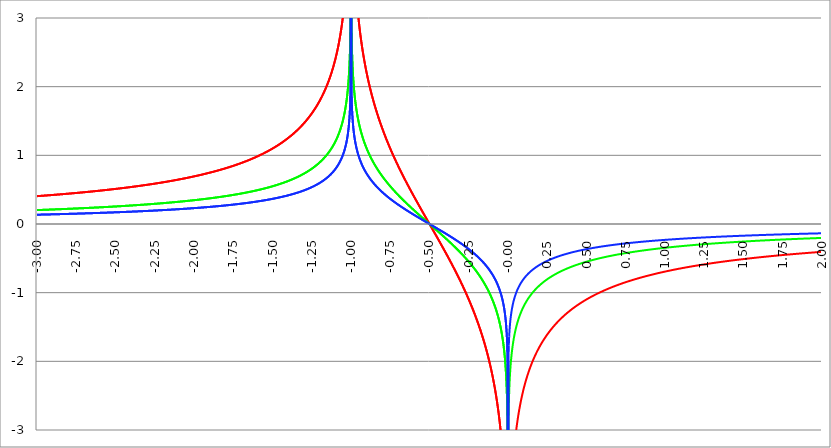
| Category | Series 1 | Series 0 | Series 2 |
|---|---|---|---|
| -3.0 | 0.405 | 0.203 | 0.135 |
| -2.9975 | 0.406 | 0.203 | 0.135 |
| -2.995 | 0.406 | 0.203 | 0.135 |
| -2.9925 | 0.407 | 0.203 | 0.136 |
| -2.99 | 0.407 | 0.204 | 0.136 |
| -2.9875 | 0.408 | 0.204 | 0.136 |
| -2.985 | 0.408 | 0.204 | 0.136 |
| -2.9825 | 0.408 | 0.204 | 0.136 |
| -2.98 | 0.409 | 0.204 | 0.136 |
| -2.9775 | 0.409 | 0.205 | 0.136 |
| -2.975000000000001 | 0.41 | 0.205 | 0.137 |
| -2.972500000000001 | 0.41 | 0.205 | 0.137 |
| -2.970000000000001 | 0.411 | 0.205 | 0.137 |
| -2.967500000000001 | 0.411 | 0.205 | 0.137 |
| -2.965000000000001 | 0.411 | 0.206 | 0.137 |
| -2.962500000000001 | 0.412 | 0.206 | 0.137 |
| -2.960000000000001 | 0.412 | 0.206 | 0.137 |
| -2.957500000000001 | 0.413 | 0.206 | 0.138 |
| -2.955000000000001 | 0.413 | 0.207 | 0.138 |
| -2.952500000000001 | 0.414 | 0.207 | 0.138 |
| -2.950000000000001 | 0.414 | 0.207 | 0.138 |
| -2.947500000000001 | 0.414 | 0.207 | 0.138 |
| -2.945000000000001 | 0.415 | 0.207 | 0.138 |
| -2.942500000000001 | 0.415 | 0.208 | 0.138 |
| -2.940000000000001 | 0.416 | 0.208 | 0.139 |
| -2.937500000000001 | 0.416 | 0.208 | 0.139 |
| -2.935000000000001 | 0.417 | 0.208 | 0.139 |
| -2.932500000000001 | 0.417 | 0.209 | 0.139 |
| -2.930000000000001 | 0.417 | 0.209 | 0.139 |
| -2.927500000000002 | 0.418 | 0.209 | 0.139 |
| -2.925000000000002 | 0.418 | 0.209 | 0.139 |
| -2.922500000000002 | 0.419 | 0.209 | 0.14 |
| -2.920000000000002 | 0.419 | 0.21 | 0.14 |
| -2.917500000000002 | 0.42 | 0.21 | 0.14 |
| -2.915000000000002 | 0.42 | 0.21 | 0.14 |
| -2.912500000000002 | 0.421 | 0.21 | 0.14 |
| -2.910000000000002 | 0.421 | 0.211 | 0.14 |
| -2.907500000000002 | 0.422 | 0.211 | 0.141 |
| -2.905000000000002 | 0.422 | 0.211 | 0.141 |
| -2.902500000000002 | 0.422 | 0.211 | 0.141 |
| -2.900000000000002 | 0.423 | 0.211 | 0.141 |
| -2.897500000000002 | 0.423 | 0.212 | 0.141 |
| -2.895000000000002 | 0.424 | 0.212 | 0.141 |
| -2.892500000000002 | 0.424 | 0.212 | 0.141 |
| -2.890000000000002 | 0.425 | 0.212 | 0.142 |
| -2.887500000000002 | 0.425 | 0.213 | 0.142 |
| -2.885000000000002 | 0.426 | 0.213 | 0.142 |
| -2.882500000000002 | 0.426 | 0.213 | 0.142 |
| -2.880000000000002 | 0.427 | 0.213 | 0.142 |
| -2.877500000000003 | 0.427 | 0.213 | 0.142 |
| -2.875000000000003 | 0.427 | 0.214 | 0.142 |
| -2.872500000000003 | 0.428 | 0.214 | 0.143 |
| -2.870000000000003 | 0.428 | 0.214 | 0.143 |
| -2.867500000000003 | 0.429 | 0.214 | 0.143 |
| -2.865000000000003 | 0.429 | 0.215 | 0.143 |
| -2.862500000000003 | 0.43 | 0.215 | 0.143 |
| -2.860000000000003 | 0.43 | 0.215 | 0.143 |
| -2.857500000000003 | 0.431 | 0.215 | 0.144 |
| -2.855000000000003 | 0.431 | 0.216 | 0.144 |
| -2.852500000000003 | 0.432 | 0.216 | 0.144 |
| -2.850000000000003 | 0.432 | 0.216 | 0.144 |
| -2.847500000000003 | 0.433 | 0.216 | 0.144 |
| -2.845000000000003 | 0.433 | 0.217 | 0.144 |
| -2.842500000000003 | 0.434 | 0.217 | 0.145 |
| -2.840000000000003 | 0.434 | 0.217 | 0.145 |
| -2.837500000000003 | 0.435 | 0.217 | 0.145 |
| -2.835000000000003 | 0.435 | 0.217 | 0.145 |
| -2.832500000000004 | 0.435 | 0.218 | 0.145 |
| -2.830000000000004 | 0.436 | 0.218 | 0.145 |
| -2.827500000000004 | 0.436 | 0.218 | 0.145 |
| -2.825000000000004 | 0.437 | 0.218 | 0.146 |
| -2.822500000000004 | 0.437 | 0.219 | 0.146 |
| -2.820000000000004 | 0.438 | 0.219 | 0.146 |
| -2.817500000000004 | 0.438 | 0.219 | 0.146 |
| -2.815000000000004 | 0.439 | 0.219 | 0.146 |
| -2.812500000000004 | 0.439 | 0.22 | 0.146 |
| -2.810000000000004 | 0.44 | 0.22 | 0.147 |
| -2.807500000000004 | 0.44 | 0.22 | 0.147 |
| -2.805000000000004 | 0.441 | 0.22 | 0.147 |
| -2.802500000000004 | 0.441 | 0.221 | 0.147 |
| -2.800000000000004 | 0.442 | 0.221 | 0.147 |
| -2.797500000000004 | 0.442 | 0.221 | 0.147 |
| -2.795000000000004 | 0.443 | 0.221 | 0.148 |
| -2.792500000000004 | 0.443 | 0.222 | 0.148 |
| -2.790000000000004 | 0.444 | 0.222 | 0.148 |
| -2.787500000000004 | 0.444 | 0.222 | 0.148 |
| -2.785000000000004 | 0.445 | 0.222 | 0.148 |
| -2.782500000000005 | 0.445 | 0.223 | 0.148 |
| -2.780000000000005 | 0.446 | 0.223 | 0.149 |
| -2.777500000000005 | 0.446 | 0.223 | 0.149 |
| -2.775000000000005 | 0.447 | 0.223 | 0.149 |
| -2.772500000000005 | 0.447 | 0.224 | 0.149 |
| -2.770000000000005 | 0.448 | 0.224 | 0.149 |
| -2.767500000000005 | 0.448 | 0.224 | 0.149 |
| -2.765000000000005 | 0.449 | 0.224 | 0.15 |
| -2.762500000000005 | 0.449 | 0.225 | 0.15 |
| -2.760000000000005 | 0.45 | 0.225 | 0.15 |
| -2.757500000000005 | 0.45 | 0.225 | 0.15 |
| -2.755000000000005 | 0.451 | 0.225 | 0.15 |
| -2.752500000000005 | 0.451 | 0.226 | 0.15 |
| -2.750000000000005 | 0.452 | 0.226 | 0.151 |
| -2.747500000000005 | 0.453 | 0.226 | 0.151 |
| -2.745000000000005 | 0.453 | 0.227 | 0.151 |
| -2.742500000000005 | 0.454 | 0.227 | 0.151 |
| -2.740000000000005 | 0.454 | 0.227 | 0.151 |
| -2.737500000000006 | 0.455 | 0.227 | 0.152 |
| -2.735000000000006 | 0.455 | 0.228 | 0.152 |
| -2.732500000000006 | 0.456 | 0.228 | 0.152 |
| -2.730000000000006 | 0.456 | 0.228 | 0.152 |
| -2.727500000000006 | 0.457 | 0.228 | 0.152 |
| -2.725000000000006 | 0.457 | 0.229 | 0.152 |
| -2.722500000000006 | 0.458 | 0.229 | 0.153 |
| -2.720000000000006 | 0.458 | 0.229 | 0.153 |
| -2.717500000000006 | 0.459 | 0.229 | 0.153 |
| -2.715000000000006 | 0.459 | 0.23 | 0.153 |
| -2.712500000000006 | 0.46 | 0.23 | 0.153 |
| -2.710000000000006 | 0.46 | 0.23 | 0.153 |
| -2.707500000000006 | 0.461 | 0.23 | 0.154 |
| -2.705000000000006 | 0.462 | 0.231 | 0.154 |
| -2.702500000000006 | 0.462 | 0.231 | 0.154 |
| -2.700000000000006 | 0.463 | 0.231 | 0.154 |
| -2.697500000000006 | 0.463 | 0.232 | 0.154 |
| -2.695000000000006 | 0.464 | 0.232 | 0.155 |
| -2.692500000000006 | 0.464 | 0.232 | 0.155 |
| -2.690000000000006 | 0.465 | 0.232 | 0.155 |
| -2.687500000000006 | 0.465 | 0.233 | 0.155 |
| -2.685000000000007 | 0.466 | 0.233 | 0.155 |
| -2.682500000000007 | 0.466 | 0.233 | 0.155 |
| -2.680000000000007 | 0.467 | 0.234 | 0.156 |
| -2.677500000000007 | 0.468 | 0.234 | 0.156 |
| -2.675000000000007 | 0.468 | 0.234 | 0.156 |
| -2.672500000000007 | 0.469 | 0.234 | 0.156 |
| -2.670000000000007 | 0.469 | 0.235 | 0.156 |
| -2.667500000000007 | 0.47 | 0.235 | 0.157 |
| -2.665000000000007 | 0.47 | 0.235 | 0.157 |
| -2.662500000000007 | 0.471 | 0.235 | 0.157 |
| -2.660000000000007 | 0.472 | 0.236 | 0.157 |
| -2.657500000000007 | 0.472 | 0.236 | 0.157 |
| -2.655000000000007 | 0.473 | 0.236 | 0.158 |
| -2.652500000000007 | 0.473 | 0.237 | 0.158 |
| -2.650000000000007 | 0.474 | 0.237 | 0.158 |
| -2.647500000000007 | 0.474 | 0.237 | 0.158 |
| -2.645000000000007 | 0.475 | 0.237 | 0.158 |
| -2.642500000000008 | 0.476 | 0.238 | 0.159 |
| -2.640000000000008 | 0.476 | 0.238 | 0.159 |
| -2.637500000000008 | 0.477 | 0.238 | 0.159 |
| -2.635000000000008 | 0.477 | 0.239 | 0.159 |
| -2.632500000000008 | 0.478 | 0.239 | 0.159 |
| -2.630000000000008 | 0.478 | 0.239 | 0.159 |
| -2.627500000000008 | 0.479 | 0.239 | 0.16 |
| -2.625000000000008 | 0.48 | 0.24 | 0.16 |
| -2.622500000000008 | 0.48 | 0.24 | 0.16 |
| -2.620000000000008 | 0.481 | 0.24 | 0.16 |
| -2.617500000000008 | 0.481 | 0.241 | 0.16 |
| -2.615000000000008 | 0.482 | 0.241 | 0.161 |
| -2.612500000000008 | 0.483 | 0.241 | 0.161 |
| -2.610000000000008 | 0.483 | 0.242 | 0.161 |
| -2.607500000000008 | 0.484 | 0.242 | 0.161 |
| -2.605000000000008 | 0.484 | 0.242 | 0.161 |
| -2.602500000000008 | 0.485 | 0.242 | 0.162 |
| -2.600000000000008 | 0.486 | 0.243 | 0.162 |
| -2.597500000000009 | 0.486 | 0.243 | 0.162 |
| -2.595000000000009 | 0.487 | 0.243 | 0.162 |
| -2.592500000000009 | 0.487 | 0.244 | 0.162 |
| -2.590000000000009 | 0.488 | 0.244 | 0.163 |
| -2.587500000000009 | 0.489 | 0.244 | 0.163 |
| -2.585000000000009 | 0.489 | 0.245 | 0.163 |
| -2.582500000000009 | 0.49 | 0.245 | 0.163 |
| -2.580000000000009 | 0.49 | 0.245 | 0.163 |
| -2.577500000000009 | 0.491 | 0.245 | 0.164 |
| -2.575000000000009 | 0.492 | 0.246 | 0.164 |
| -2.572500000000009 | 0.492 | 0.246 | 0.164 |
| -2.570000000000009 | 0.493 | 0.246 | 0.164 |
| -2.56750000000001 | 0.493 | 0.247 | 0.164 |
| -2.565000000000009 | 0.494 | 0.247 | 0.165 |
| -2.562500000000009 | 0.495 | 0.247 | 0.165 |
| -2.560000000000009 | 0.495 | 0.248 | 0.165 |
| -2.557500000000009 | 0.496 | 0.248 | 0.165 |
| -2.555000000000009 | 0.497 | 0.248 | 0.166 |
| -2.55250000000001 | 0.497 | 0.249 | 0.166 |
| -2.55000000000001 | 0.498 | 0.249 | 0.166 |
| -2.54750000000001 | 0.498 | 0.249 | 0.166 |
| -2.54500000000001 | 0.499 | 0.25 | 0.166 |
| -2.54250000000001 | 0.5 | 0.25 | 0.167 |
| -2.54000000000001 | 0.5 | 0.25 | 0.167 |
| -2.53750000000001 | 0.501 | 0.251 | 0.167 |
| -2.53500000000001 | 0.502 | 0.251 | 0.167 |
| -2.53250000000001 | 0.502 | 0.251 | 0.167 |
| -2.53000000000001 | 0.503 | 0.251 | 0.168 |
| -2.52750000000001 | 0.504 | 0.252 | 0.168 |
| -2.52500000000001 | 0.504 | 0.252 | 0.168 |
| -2.52250000000001 | 0.505 | 0.252 | 0.168 |
| -2.52000000000001 | 0.506 | 0.253 | 0.169 |
| -2.51750000000001 | 0.506 | 0.253 | 0.169 |
| -2.51500000000001 | 0.507 | 0.253 | 0.169 |
| -2.51250000000001 | 0.508 | 0.254 | 0.169 |
| -2.51000000000001 | 0.508 | 0.254 | 0.169 |
| -2.50750000000001 | 0.509 | 0.254 | 0.17 |
| -2.505000000000011 | 0.509 | 0.255 | 0.17 |
| -2.502500000000011 | 0.51 | 0.255 | 0.17 |
| -2.500000000000011 | 0.511 | 0.255 | 0.17 |
| -2.497500000000011 | 0.511 | 0.256 | 0.17 |
| -2.495000000000011 | 0.512 | 0.256 | 0.171 |
| -2.492500000000011 | 0.513 | 0.256 | 0.171 |
| -2.490000000000011 | 0.514 | 0.257 | 0.171 |
| -2.487500000000011 | 0.514 | 0.257 | 0.171 |
| -2.485000000000011 | 0.515 | 0.257 | 0.172 |
| -2.482500000000011 | 0.516 | 0.258 | 0.172 |
| -2.480000000000011 | 0.516 | 0.258 | 0.172 |
| -2.477500000000011 | 0.517 | 0.258 | 0.172 |
| -2.475000000000011 | 0.518 | 0.259 | 0.173 |
| -2.472500000000011 | 0.518 | 0.259 | 0.173 |
| -2.470000000000011 | 0.519 | 0.259 | 0.173 |
| -2.467500000000011 | 0.52 | 0.26 | 0.173 |
| -2.465000000000011 | 0.52 | 0.26 | 0.173 |
| -2.462500000000011 | 0.521 | 0.261 | 0.174 |
| -2.460000000000011 | 0.522 | 0.261 | 0.174 |
| -2.457500000000012 | 0.522 | 0.261 | 0.174 |
| -2.455000000000012 | 0.523 | 0.262 | 0.174 |
| -2.452500000000012 | 0.524 | 0.262 | 0.175 |
| -2.450000000000012 | 0.525 | 0.262 | 0.175 |
| -2.447500000000012 | 0.525 | 0.263 | 0.175 |
| -2.445000000000012 | 0.526 | 0.263 | 0.175 |
| -2.442500000000012 | 0.527 | 0.263 | 0.176 |
| -2.440000000000012 | 0.527 | 0.264 | 0.176 |
| -2.437500000000012 | 0.528 | 0.264 | 0.176 |
| -2.435000000000012 | 0.529 | 0.264 | 0.176 |
| -2.432500000000012 | 0.529 | 0.265 | 0.176 |
| -2.430000000000012 | 0.53 | 0.265 | 0.177 |
| -2.427500000000012 | 0.531 | 0.265 | 0.177 |
| -2.425000000000012 | 0.532 | 0.266 | 0.177 |
| -2.422500000000012 | 0.532 | 0.266 | 0.177 |
| -2.420000000000012 | 0.533 | 0.267 | 0.178 |
| -2.417500000000012 | 0.534 | 0.267 | 0.178 |
| -2.415000000000012 | 0.535 | 0.267 | 0.178 |
| -2.412500000000012 | 0.535 | 0.268 | 0.178 |
| -2.410000000000013 | 0.536 | 0.268 | 0.179 |
| -2.407500000000012 | 0.537 | 0.268 | 0.179 |
| -2.405000000000013 | 0.538 | 0.269 | 0.179 |
| -2.402500000000013 | 0.538 | 0.269 | 0.179 |
| -2.400000000000013 | 0.539 | 0.269 | 0.18 |
| -2.397500000000013 | 0.54 | 0.27 | 0.18 |
| -2.395000000000013 | 0.54 | 0.27 | 0.18 |
| -2.392500000000013 | 0.541 | 0.271 | 0.18 |
| -2.390000000000013 | 0.542 | 0.271 | 0.181 |
| -2.387500000000013 | 0.543 | 0.271 | 0.181 |
| -2.385000000000013 | 0.543 | 0.272 | 0.181 |
| -2.382500000000013 | 0.544 | 0.272 | 0.181 |
| -2.380000000000013 | 0.545 | 0.273 | 0.182 |
| -2.377500000000013 | 0.546 | 0.273 | 0.182 |
| -2.375000000000013 | 0.547 | 0.273 | 0.182 |
| -2.372500000000013 | 0.547 | 0.274 | 0.182 |
| -2.370000000000013 | 0.548 | 0.274 | 0.183 |
| -2.367500000000013 | 0.549 | 0.274 | 0.183 |
| -2.365000000000013 | 0.55 | 0.275 | 0.183 |
| -2.362500000000014 | 0.55 | 0.275 | 0.183 |
| -2.360000000000014 | 0.551 | 0.276 | 0.184 |
| -2.357500000000014 | 0.552 | 0.276 | 0.184 |
| -2.355000000000014 | 0.553 | 0.276 | 0.184 |
| -2.352500000000014 | 0.554 | 0.277 | 0.185 |
| -2.350000000000014 | 0.554 | 0.277 | 0.185 |
| -2.347500000000014 | 0.555 | 0.278 | 0.185 |
| -2.345000000000014 | 0.556 | 0.278 | 0.185 |
| -2.342500000000014 | 0.557 | 0.278 | 0.186 |
| -2.340000000000014 | 0.557 | 0.279 | 0.186 |
| -2.337500000000014 | 0.558 | 0.279 | 0.186 |
| -2.335000000000014 | 0.559 | 0.28 | 0.186 |
| -2.332500000000014 | 0.56 | 0.28 | 0.187 |
| -2.330000000000014 | 0.561 | 0.28 | 0.187 |
| -2.327500000000014 | 0.561 | 0.281 | 0.187 |
| -2.325000000000014 | 0.562 | 0.281 | 0.187 |
| -2.322500000000014 | 0.563 | 0.282 | 0.188 |
| -2.320000000000014 | 0.564 | 0.282 | 0.188 |
| -2.317500000000015 | 0.565 | 0.282 | 0.188 |
| -2.315000000000015 | 0.566 | 0.283 | 0.189 |
| -2.312500000000015 | 0.566 | 0.283 | 0.189 |
| -2.310000000000015 | 0.567 | 0.284 | 0.189 |
| -2.307500000000015 | 0.568 | 0.284 | 0.189 |
| -2.305000000000015 | 0.569 | 0.284 | 0.19 |
| -2.302500000000015 | 0.57 | 0.285 | 0.19 |
| -2.300000000000015 | 0.571 | 0.285 | 0.19 |
| -2.297500000000015 | 0.571 | 0.286 | 0.19 |
| -2.295000000000015 | 0.572 | 0.286 | 0.191 |
| -2.292500000000015 | 0.573 | 0.287 | 0.191 |
| -2.290000000000015 | 0.574 | 0.287 | 0.191 |
| -2.287500000000015 | 0.575 | 0.287 | 0.192 |
| -2.285000000000015 | 0.576 | 0.288 | 0.192 |
| -2.282500000000015 | 0.576 | 0.288 | 0.192 |
| -2.280000000000015 | 0.577 | 0.289 | 0.192 |
| -2.277500000000015 | 0.578 | 0.289 | 0.193 |
| -2.275000000000015 | 0.579 | 0.29 | 0.193 |
| -2.272500000000015 | 0.58 | 0.29 | 0.193 |
| -2.270000000000016 | 0.581 | 0.29 | 0.194 |
| -2.267500000000015 | 0.582 | 0.291 | 0.194 |
| -2.265000000000016 | 0.583 | 0.291 | 0.194 |
| -2.262500000000016 | 0.583 | 0.292 | 0.194 |
| -2.260000000000016 | 0.584 | 0.292 | 0.195 |
| -2.257500000000016 | 0.585 | 0.293 | 0.195 |
| -2.255000000000016 | 0.586 | 0.293 | 0.195 |
| -2.252500000000016 | 0.587 | 0.293 | 0.196 |
| -2.250000000000016 | 0.588 | 0.294 | 0.196 |
| -2.247500000000016 | 0.589 | 0.294 | 0.196 |
| -2.245000000000016 | 0.59 | 0.295 | 0.197 |
| -2.242500000000016 | 0.59 | 0.295 | 0.197 |
| -2.240000000000016 | 0.591 | 0.296 | 0.197 |
| -2.237500000000016 | 0.592 | 0.296 | 0.197 |
| -2.235000000000016 | 0.593 | 0.297 | 0.198 |
| -2.232500000000016 | 0.594 | 0.297 | 0.198 |
| -2.230000000000016 | 0.595 | 0.297 | 0.198 |
| -2.227500000000016 | 0.596 | 0.298 | 0.199 |
| -2.225000000000016 | 0.597 | 0.298 | 0.199 |
| -2.222500000000016 | 0.598 | 0.299 | 0.199 |
| -2.220000000000016 | 0.599 | 0.299 | 0.2 |
| -2.217500000000016 | 0.6 | 0.3 | 0.2 |
| -2.215000000000017 | 0.601 | 0.3 | 0.2 |
| -2.212500000000017 | 0.601 | 0.301 | 0.2 |
| -2.210000000000017 | 0.602 | 0.301 | 0.201 |
| -2.207500000000016 | 0.603 | 0.302 | 0.201 |
| -2.205000000000017 | 0.604 | 0.302 | 0.201 |
| -2.202500000000017 | 0.605 | 0.303 | 0.202 |
| -2.200000000000017 | 0.606 | 0.303 | 0.202 |
| -2.197500000000017 | 0.607 | 0.304 | 0.202 |
| -2.195000000000017 | 0.608 | 0.304 | 0.203 |
| -2.192500000000017 | 0.609 | 0.304 | 0.203 |
| -2.190000000000017 | 0.61 | 0.305 | 0.203 |
| -2.187500000000017 | 0.611 | 0.305 | 0.204 |
| -2.185000000000017 | 0.612 | 0.306 | 0.204 |
| -2.182500000000017 | 0.613 | 0.306 | 0.204 |
| -2.180000000000017 | 0.614 | 0.307 | 0.205 |
| -2.177500000000017 | 0.615 | 0.307 | 0.205 |
| -2.175000000000018 | 0.616 | 0.308 | 0.205 |
| -2.172500000000018 | 0.617 | 0.308 | 0.206 |
| -2.170000000000018 | 0.618 | 0.309 | 0.206 |
| -2.167500000000017 | 0.619 | 0.309 | 0.206 |
| -2.165000000000018 | 0.62 | 0.31 | 0.207 |
| -2.162500000000018 | 0.621 | 0.31 | 0.207 |
| -2.160000000000018 | 0.622 | 0.311 | 0.207 |
| -2.157500000000018 | 0.623 | 0.311 | 0.208 |
| -2.155000000000018 | 0.624 | 0.312 | 0.208 |
| -2.152500000000018 | 0.625 | 0.312 | 0.208 |
| -2.150000000000018 | 0.626 | 0.313 | 0.209 |
| -2.147500000000018 | 0.627 | 0.313 | 0.209 |
| -2.145000000000018 | 0.628 | 0.314 | 0.209 |
| -2.142500000000018 | 0.629 | 0.314 | 0.21 |
| -2.140000000000018 | 0.63 | 0.315 | 0.21 |
| -2.137500000000018 | 0.631 | 0.315 | 0.21 |
| -2.135000000000018 | 0.632 | 0.316 | 0.211 |
| -2.132500000000018 | 0.633 | 0.316 | 0.211 |
| -2.130000000000019 | 0.634 | 0.317 | 0.211 |
| -2.127500000000018 | 0.635 | 0.317 | 0.212 |
| -2.125000000000019 | 0.636 | 0.318 | 0.212 |
| -2.122500000000019 | 0.637 | 0.319 | 0.212 |
| -2.120000000000019 | 0.638 | 0.319 | 0.213 |
| -2.117500000000019 | 0.639 | 0.32 | 0.213 |
| -2.115000000000019 | 0.64 | 0.32 | 0.213 |
| -2.112500000000019 | 0.641 | 0.321 | 0.214 |
| -2.110000000000019 | 0.642 | 0.321 | 0.214 |
| -2.10750000000002 | 0.643 | 0.322 | 0.214 |
| -2.10500000000002 | 0.644 | 0.322 | 0.215 |
| -2.10250000000002 | 0.646 | 0.323 | 0.215 |
| -2.10000000000002 | 0.647 | 0.323 | 0.216 |
| -2.09750000000002 | 0.648 | 0.324 | 0.216 |
| -2.095000000000019 | 0.649 | 0.324 | 0.216 |
| -2.092500000000019 | 0.65 | 0.325 | 0.217 |
| -2.090000000000019 | 0.651 | 0.325 | 0.217 |
| -2.08750000000002 | 0.652 | 0.326 | 0.217 |
| -2.085000000000019 | 0.653 | 0.327 | 0.218 |
| -2.08250000000002 | 0.654 | 0.327 | 0.218 |
| -2.08000000000002 | 0.655 | 0.328 | 0.218 |
| -2.07750000000002 | 0.657 | 0.328 | 0.219 |
| -2.07500000000002 | 0.658 | 0.329 | 0.219 |
| -2.07250000000002 | 0.659 | 0.329 | 0.22 |
| -2.07000000000002 | 0.66 | 0.33 | 0.22 |
| -2.06750000000002 | 0.661 | 0.331 | 0.22 |
| -2.06500000000002 | 0.662 | 0.331 | 0.221 |
| -2.06250000000002 | 0.663 | 0.332 | 0.221 |
| -2.06000000000002 | 0.664 | 0.332 | 0.221 |
| -2.05750000000002 | 0.666 | 0.333 | 0.222 |
| -2.05500000000002 | 0.667 | 0.333 | 0.222 |
| -2.05250000000002 | 0.668 | 0.334 | 0.223 |
| -2.05000000000002 | 0.669 | 0.335 | 0.223 |
| -2.04750000000002 | 0.67 | 0.335 | 0.223 |
| -2.04500000000002 | 0.671 | 0.336 | 0.224 |
| -2.04250000000002 | 0.673 | 0.336 | 0.224 |
| -2.04000000000002 | 0.674 | 0.337 | 0.225 |
| -2.037500000000021 | 0.675 | 0.337 | 0.225 |
| -2.035000000000021 | 0.676 | 0.338 | 0.225 |
| -2.032500000000021 | 0.677 | 0.339 | 0.226 |
| -2.030000000000021 | 0.678 | 0.339 | 0.226 |
| -2.027500000000021 | 0.68 | 0.34 | 0.227 |
| -2.025000000000021 | 0.681 | 0.34 | 0.227 |
| -2.022500000000021 | 0.682 | 0.341 | 0.227 |
| -2.020000000000021 | 0.683 | 0.342 | 0.228 |
| -2.017500000000021 | 0.685 | 0.342 | 0.228 |
| -2.015000000000021 | 0.686 | 0.343 | 0.229 |
| -2.012500000000021 | 0.687 | 0.343 | 0.229 |
| -2.010000000000021 | 0.688 | 0.344 | 0.229 |
| -2.007500000000021 | 0.689 | 0.345 | 0.23 |
| -2.005000000000021 | 0.691 | 0.345 | 0.23 |
| -2.002500000000021 | 0.692 | 0.346 | 0.231 |
| -2.000000000000021 | 0.693 | 0.347 | 0.231 |
| -1.997500000000021 | 0.694 | 0.347 | 0.231 |
| -1.995000000000021 | 0.696 | 0.348 | 0.232 |
| -1.992500000000021 | 0.697 | 0.348 | 0.232 |
| -1.990000000000021 | 0.698 | 0.349 | 0.233 |
| -1.987500000000022 | 0.699 | 0.35 | 0.233 |
| -1.985000000000022 | 0.701 | 0.35 | 0.234 |
| -1.982500000000022 | 0.702 | 0.351 | 0.234 |
| -1.980000000000022 | 0.703 | 0.352 | 0.234 |
| -1.977500000000022 | 0.705 | 0.352 | 0.235 |
| -1.975000000000022 | 0.706 | 0.353 | 0.235 |
| -1.972500000000022 | 0.707 | 0.354 | 0.236 |
| -1.970000000000022 | 0.708 | 0.354 | 0.236 |
| -1.967500000000022 | 0.71 | 0.355 | 0.237 |
| -1.965000000000022 | 0.711 | 0.356 | 0.237 |
| -1.962500000000022 | 0.712 | 0.356 | 0.237 |
| -1.960000000000022 | 0.714 | 0.357 | 0.238 |
| -1.957500000000022 | 0.715 | 0.358 | 0.238 |
| -1.955000000000022 | 0.716 | 0.358 | 0.239 |
| -1.952500000000022 | 0.718 | 0.359 | 0.239 |
| -1.950000000000022 | 0.719 | 0.36 | 0.24 |
| -1.947500000000022 | 0.72 | 0.36 | 0.24 |
| -1.945000000000022 | 0.722 | 0.361 | 0.241 |
| -1.942500000000023 | 0.723 | 0.362 | 0.241 |
| -1.940000000000023 | 0.725 | 0.362 | 0.242 |
| -1.937500000000023 | 0.726 | 0.363 | 0.242 |
| -1.935000000000023 | 0.727 | 0.364 | 0.242 |
| -1.932500000000023 | 0.729 | 0.364 | 0.243 |
| -1.930000000000023 | 0.73 | 0.365 | 0.243 |
| -1.927500000000023 | 0.731 | 0.366 | 0.244 |
| -1.925000000000023 | 0.733 | 0.366 | 0.244 |
| -1.922500000000023 | 0.734 | 0.367 | 0.245 |
| -1.920000000000023 | 0.736 | 0.368 | 0.245 |
| -1.917500000000023 | 0.737 | 0.369 | 0.246 |
| -1.915000000000023 | 0.739 | 0.369 | 0.246 |
| -1.912500000000023 | 0.74 | 0.37 | 0.247 |
| -1.910000000000023 | 0.741 | 0.371 | 0.247 |
| -1.907500000000023 | 0.743 | 0.371 | 0.248 |
| -1.905000000000023 | 0.744 | 0.372 | 0.248 |
| -1.902500000000023 | 0.746 | 0.373 | 0.249 |
| -1.900000000000023 | 0.747 | 0.374 | 0.249 |
| -1.897500000000023 | 0.749 | 0.374 | 0.25 |
| -1.895000000000023 | 0.75 | 0.375 | 0.25 |
| -1.892500000000024 | 0.752 | 0.376 | 0.251 |
| -1.890000000000024 | 0.753 | 0.377 | 0.251 |
| -1.887500000000024 | 0.755 | 0.377 | 0.252 |
| -1.885000000000024 | 0.756 | 0.378 | 0.252 |
| -1.882500000000024 | 0.758 | 0.379 | 0.253 |
| -1.880000000000024 | 0.759 | 0.38 | 0.253 |
| -1.877500000000024 | 0.761 | 0.38 | 0.254 |
| -1.875000000000024 | 0.762 | 0.381 | 0.254 |
| -1.872500000000024 | 0.764 | 0.382 | 0.255 |
| -1.870000000000024 | 0.765 | 0.383 | 0.255 |
| -1.867500000000024 | 0.767 | 0.383 | 0.256 |
| -1.865000000000024 | 0.768 | 0.384 | 0.256 |
| -1.862500000000024 | 0.77 | 0.385 | 0.257 |
| -1.860000000000024 | 0.771 | 0.386 | 0.257 |
| -1.857500000000024 | 0.773 | 0.386 | 0.258 |
| -1.855000000000024 | 0.775 | 0.387 | 0.258 |
| -1.852500000000024 | 0.776 | 0.388 | 0.259 |
| -1.850000000000024 | 0.778 | 0.389 | 0.259 |
| -1.847500000000025 | 0.779 | 0.39 | 0.26 |
| -1.845000000000025 | 0.781 | 0.39 | 0.26 |
| -1.842500000000025 | 0.783 | 0.391 | 0.261 |
| -1.840000000000025 | 0.784 | 0.392 | 0.261 |
| -1.837500000000025 | 0.786 | 0.393 | 0.262 |
| -1.835000000000025 | 0.787 | 0.394 | 0.262 |
| -1.832500000000025 | 0.789 | 0.395 | 0.263 |
| -1.830000000000025 | 0.791 | 0.395 | 0.264 |
| -1.827500000000025 | 0.792 | 0.396 | 0.264 |
| -1.825000000000025 | 0.794 | 0.397 | 0.265 |
| -1.822500000000025 | 0.796 | 0.398 | 0.265 |
| -1.820000000000025 | 0.797 | 0.399 | 0.266 |
| -1.817500000000025 | 0.799 | 0.399 | 0.266 |
| -1.815000000000025 | 0.801 | 0.4 | 0.267 |
| -1.812500000000025 | 0.802 | 0.401 | 0.267 |
| -1.810000000000025 | 0.804 | 0.402 | 0.268 |
| -1.807500000000025 | 0.806 | 0.403 | 0.269 |
| -1.805000000000025 | 0.807 | 0.404 | 0.269 |
| -1.802500000000025 | 0.809 | 0.405 | 0.27 |
| -1.800000000000026 | 0.811 | 0.405 | 0.27 |
| -1.797500000000026 | 0.813 | 0.406 | 0.271 |
| -1.795000000000026 | 0.814 | 0.407 | 0.271 |
| -1.792500000000026 | 0.816 | 0.408 | 0.272 |
| -1.790000000000026 | 0.818 | 0.409 | 0.273 |
| -1.787500000000026 | 0.82 | 0.41 | 0.273 |
| -1.785000000000026 | 0.821 | 0.411 | 0.274 |
| -1.782500000000026 | 0.823 | 0.412 | 0.274 |
| -1.780000000000026 | 0.825 | 0.413 | 0.275 |
| -1.777500000000026 | 0.827 | 0.413 | 0.276 |
| -1.775000000000026 | 0.829 | 0.414 | 0.276 |
| -1.772500000000026 | 0.831 | 0.415 | 0.277 |
| -1.770000000000026 | 0.832 | 0.416 | 0.277 |
| -1.767500000000026 | 0.834 | 0.417 | 0.278 |
| -1.765000000000026 | 0.836 | 0.418 | 0.279 |
| -1.762500000000026 | 0.838 | 0.419 | 0.279 |
| -1.760000000000026 | 0.84 | 0.42 | 0.28 |
| -1.757500000000026 | 0.842 | 0.421 | 0.281 |
| -1.755000000000026 | 0.844 | 0.422 | 0.281 |
| -1.752500000000027 | 0.845 | 0.423 | 0.282 |
| -1.750000000000027 | 0.847 | 0.424 | 0.282 |
| -1.747500000000027 | 0.849 | 0.425 | 0.283 |
| -1.745000000000027 | 0.851 | 0.426 | 0.284 |
| -1.742500000000027 | 0.853 | 0.427 | 0.284 |
| -1.740000000000027 | 0.855 | 0.427 | 0.285 |
| -1.737500000000027 | 0.857 | 0.428 | 0.286 |
| -1.735000000000027 | 0.859 | 0.429 | 0.286 |
| -1.732500000000027 | 0.861 | 0.43 | 0.287 |
| -1.730000000000027 | 0.863 | 0.431 | 0.288 |
| -1.727500000000027 | 0.865 | 0.432 | 0.288 |
| -1.725000000000027 | 0.867 | 0.433 | 0.289 |
| -1.722500000000027 | 0.869 | 0.434 | 0.29 |
| -1.720000000000027 | 0.871 | 0.435 | 0.29 |
| -1.717500000000027 | 0.873 | 0.436 | 0.291 |
| -1.715000000000027 | 0.875 | 0.437 | 0.292 |
| -1.712500000000027 | 0.877 | 0.438 | 0.292 |
| -1.710000000000027 | 0.879 | 0.439 | 0.293 |
| -1.707500000000027 | 0.881 | 0.441 | 0.294 |
| -1.705000000000028 | 0.883 | 0.442 | 0.294 |
| -1.702500000000028 | 0.885 | 0.443 | 0.295 |
| -1.700000000000028 | 0.887 | 0.444 | 0.296 |
| -1.697500000000028 | 0.889 | 0.445 | 0.296 |
| -1.695000000000028 | 0.892 | 0.446 | 0.297 |
| -1.692500000000028 | 0.894 | 0.447 | 0.298 |
| -1.690000000000028 | 0.896 | 0.448 | 0.299 |
| -1.687500000000028 | 0.898 | 0.449 | 0.299 |
| -1.685000000000028 | 0.9 | 0.45 | 0.3 |
| -1.682500000000028 | 0.902 | 0.451 | 0.301 |
| -1.680000000000028 | 0.904 | 0.452 | 0.301 |
| -1.677500000000028 | 0.907 | 0.453 | 0.302 |
| -1.675000000000028 | 0.909 | 0.454 | 0.303 |
| -1.672500000000028 | 0.911 | 0.456 | 0.304 |
| -1.670000000000028 | 0.913 | 0.457 | 0.304 |
| -1.667500000000028 | 0.916 | 0.458 | 0.305 |
| -1.665000000000028 | 0.918 | 0.459 | 0.306 |
| -1.662500000000028 | 0.92 | 0.46 | 0.307 |
| -1.660000000000028 | 0.922 | 0.461 | 0.307 |
| -1.657500000000029 | 0.925 | 0.462 | 0.308 |
| -1.655000000000029 | 0.927 | 0.463 | 0.309 |
| -1.652500000000029 | 0.929 | 0.465 | 0.31 |
| -1.650000000000029 | 0.932 | 0.466 | 0.311 |
| -1.647500000000029 | 0.934 | 0.467 | 0.311 |
| -1.645000000000029 | 0.936 | 0.468 | 0.312 |
| -1.642500000000029 | 0.939 | 0.469 | 0.313 |
| -1.640000000000029 | 0.941 | 0.47 | 0.314 |
| -1.637500000000029 | 0.943 | 0.472 | 0.314 |
| -1.63500000000003 | 0.946 | 0.473 | 0.315 |
| -1.63250000000003 | 0.948 | 0.474 | 0.316 |
| -1.63000000000003 | 0.951 | 0.475 | 0.317 |
| -1.627500000000029 | 0.953 | 0.477 | 0.318 |
| -1.625000000000029 | 0.956 | 0.478 | 0.319 |
| -1.622500000000029 | 0.958 | 0.479 | 0.319 |
| -1.620000000000029 | 0.96 | 0.48 | 0.32 |
| -1.617500000000029 | 0.963 | 0.481 | 0.321 |
| -1.615000000000029 | 0.965 | 0.483 | 0.322 |
| -1.612500000000029 | 0.968 | 0.484 | 0.323 |
| -1.61000000000003 | 0.971 | 0.485 | 0.324 |
| -1.60750000000003 | 0.973 | 0.487 | 0.324 |
| -1.60500000000003 | 0.976 | 0.488 | 0.325 |
| -1.60250000000003 | 0.978 | 0.489 | 0.326 |
| -1.60000000000003 | 0.981 | 0.49 | 0.327 |
| -1.59750000000003 | 0.983 | 0.492 | 0.328 |
| -1.59500000000003 | 0.986 | 0.493 | 0.329 |
| -1.59250000000003 | 0.989 | 0.494 | 0.33 |
| -1.59000000000003 | 0.991 | 0.496 | 0.33 |
| -1.58750000000003 | 0.994 | 0.497 | 0.331 |
| -1.58500000000003 | 0.997 | 0.498 | 0.332 |
| -1.58250000000003 | 0.999 | 0.5 | 0.333 |
| -1.58000000000003 | 1.002 | 0.501 | 0.334 |
| -1.57750000000003 | 1.005 | 0.502 | 0.335 |
| -1.57500000000003 | 1.008 | 0.504 | 0.336 |
| -1.57250000000003 | 1.01 | 0.505 | 0.337 |
| -1.57000000000003 | 1.013 | 0.507 | 0.338 |
| -1.567500000000031 | 1.016 | 0.508 | 0.339 |
| -1.565000000000031 | 1.019 | 0.509 | 0.34 |
| -1.562500000000031 | 1.022 | 0.511 | 0.341 |
| -1.560000000000031 | 1.025 | 0.512 | 0.342 |
| -1.557500000000031 | 1.027 | 0.514 | 0.342 |
| -1.555000000000031 | 1.03 | 0.515 | 0.343 |
| -1.552500000000031 | 1.033 | 0.517 | 0.344 |
| -1.550000000000031 | 1.036 | 0.518 | 0.345 |
| -1.547500000000031 | 1.039 | 0.52 | 0.346 |
| -1.545000000000031 | 1.042 | 0.521 | 0.347 |
| -1.542500000000031 | 1.045 | 0.522 | 0.348 |
| -1.540000000000031 | 1.048 | 0.524 | 0.349 |
| -1.537500000000031 | 1.051 | 0.525 | 0.35 |
| -1.535000000000031 | 1.054 | 0.527 | 0.351 |
| -1.532500000000031 | 1.057 | 0.529 | 0.352 |
| -1.530000000000031 | 1.06 | 0.53 | 0.353 |
| -1.527500000000031 | 1.063 | 0.532 | 0.354 |
| -1.525000000000031 | 1.066 | 0.533 | 0.355 |
| -1.522500000000031 | 1.069 | 0.535 | 0.356 |
| -1.520000000000032 | 1.073 | 0.536 | 0.358 |
| -1.517500000000032 | 1.076 | 0.538 | 0.359 |
| -1.515000000000032 | 1.079 | 0.54 | 0.36 |
| -1.512500000000032 | 1.082 | 0.541 | 0.361 |
| -1.510000000000032 | 1.085 | 0.543 | 0.362 |
| -1.507500000000032 | 1.089 | 0.544 | 0.363 |
| -1.505000000000032 | 1.092 | 0.546 | 0.364 |
| -1.502500000000032 | 1.095 | 0.548 | 0.365 |
| -1.500000000000032 | 1.099 | 0.549 | 0.366 |
| -1.497500000000032 | 1.102 | 0.551 | 0.367 |
| -1.495000000000032 | 1.105 | 0.553 | 0.368 |
| -1.492500000000032 | 1.109 | 0.554 | 0.37 |
| -1.490000000000032 | 1.112 | 0.556 | 0.371 |
| -1.487500000000032 | 1.116 | 0.558 | 0.372 |
| -1.485000000000032 | 1.119 | 0.56 | 0.373 |
| -1.482500000000032 | 1.123 | 0.561 | 0.374 |
| -1.480000000000032 | 1.126 | 0.563 | 0.375 |
| -1.477500000000032 | 1.13 | 0.565 | 0.377 |
| -1.475000000000032 | 1.133 | 0.567 | 0.378 |
| -1.472500000000033 | 1.137 | 0.568 | 0.379 |
| -1.470000000000033 | 1.14 | 0.57 | 0.38 |
| -1.467500000000033 | 1.144 | 0.572 | 0.381 |
| -1.465000000000033 | 1.148 | 0.574 | 0.383 |
| -1.462500000000033 | 1.151 | 0.576 | 0.384 |
| -1.460000000000033 | 1.155 | 0.577 | 0.385 |
| -1.457500000000033 | 1.159 | 0.579 | 0.386 |
| -1.455000000000033 | 1.162 | 0.581 | 0.387 |
| -1.452500000000033 | 1.166 | 0.583 | 0.389 |
| -1.450000000000033 | 1.17 | 0.585 | 0.39 |
| -1.447500000000033 | 1.174 | 0.587 | 0.391 |
| -1.445000000000033 | 1.178 | 0.589 | 0.393 |
| -1.442500000000033 | 1.182 | 0.591 | 0.394 |
| -1.440000000000033 | 1.186 | 0.593 | 0.395 |
| -1.437500000000033 | 1.19 | 0.595 | 0.397 |
| -1.435000000000033 | 1.194 | 0.597 | 0.398 |
| -1.432500000000033 | 1.198 | 0.599 | 0.399 |
| -1.430000000000033 | 1.202 | 0.601 | 0.401 |
| -1.427500000000033 | 1.206 | 0.603 | 0.402 |
| -1.425000000000034 | 1.21 | 0.605 | 0.403 |
| -1.422500000000034 | 1.214 | 0.607 | 0.405 |
| -1.420000000000034 | 1.218 | 0.609 | 0.406 |
| -1.417500000000034 | 1.222 | 0.611 | 0.407 |
| -1.415000000000034 | 1.227 | 0.613 | 0.409 |
| -1.412500000000034 | 1.231 | 0.615 | 0.41 |
| -1.410000000000034 | 1.235 | 0.618 | 0.412 |
| -1.407500000000034 | 1.24 | 0.62 | 0.413 |
| -1.405000000000034 | 1.244 | 0.622 | 0.415 |
| -1.402500000000034 | 1.248 | 0.624 | 0.416 |
| -1.400000000000034 | 1.253 | 0.626 | 0.418 |
| -1.397500000000034 | 1.257 | 0.629 | 0.419 |
| -1.395000000000034 | 1.262 | 0.631 | 0.421 |
| -1.392500000000034 | 1.266 | 0.633 | 0.422 |
| -1.390000000000034 | 1.271 | 0.635 | 0.424 |
| -1.387500000000034 | 1.276 | 0.638 | 0.425 |
| -1.385000000000034 | 1.28 | 0.64 | 0.427 |
| -1.382500000000034 | 1.285 | 0.642 | 0.428 |
| -1.380000000000034 | 1.29 | 0.645 | 0.43 |
| -1.377500000000035 | 1.294 | 0.647 | 0.431 |
| -1.375000000000035 | 1.299 | 0.65 | 0.433 |
| -1.372500000000035 | 1.304 | 0.652 | 0.435 |
| -1.370000000000035 | 1.309 | 0.655 | 0.436 |
| -1.367500000000035 | 1.314 | 0.657 | 0.438 |
| -1.365000000000035 | 1.319 | 0.66 | 0.44 |
| -1.362500000000035 | 1.324 | 0.662 | 0.441 |
| -1.360000000000035 | 1.329 | 0.665 | 0.443 |
| -1.357500000000035 | 1.334 | 0.667 | 0.445 |
| -1.355000000000035 | 1.339 | 0.67 | 0.446 |
| -1.352500000000035 | 1.345 | 0.672 | 0.448 |
| -1.350000000000035 | 1.35 | 0.675 | 0.45 |
| -1.347500000000035 | 1.355 | 0.678 | 0.452 |
| -1.345000000000035 | 1.361 | 0.68 | 0.454 |
| -1.342500000000035 | 1.366 | 0.683 | 0.455 |
| -1.340000000000035 | 1.371 | 0.686 | 0.457 |
| -1.337500000000035 | 1.377 | 0.688 | 0.459 |
| -1.335000000000035 | 1.383 | 0.691 | 0.461 |
| -1.332500000000035 | 1.388 | 0.694 | 0.463 |
| -1.330000000000036 | 1.394 | 0.697 | 0.465 |
| -1.327500000000036 | 1.4 | 0.7 | 0.467 |
| -1.325000000000036 | 1.405 | 0.703 | 0.468 |
| -1.322500000000036 | 1.411 | 0.706 | 0.47 |
| -1.320000000000036 | 1.417 | 0.709 | 0.472 |
| -1.317500000000036 | 1.423 | 0.712 | 0.474 |
| -1.315000000000036 | 1.429 | 0.715 | 0.476 |
| -1.312500000000036 | 1.435 | 0.718 | 0.478 |
| -1.310000000000036 | 1.441 | 0.721 | 0.48 |
| -1.307500000000036 | 1.447 | 0.724 | 0.482 |
| -1.305000000000036 | 1.454 | 0.727 | 0.485 |
| -1.302500000000036 | 1.46 | 0.73 | 0.487 |
| -1.300000000000036 | 1.466 | 0.733 | 0.489 |
| -1.297500000000036 | 1.473 | 0.736 | 0.491 |
| -1.295000000000036 | 1.479 | 0.74 | 0.493 |
| -1.292500000000036 | 1.486 | 0.743 | 0.495 |
| -1.290000000000036 | 1.493 | 0.746 | 0.498 |
| -1.287500000000036 | 1.499 | 0.75 | 0.5 |
| -1.285000000000037 | 1.506 | 0.753 | 0.502 |
| -1.282500000000037 | 1.513 | 0.756 | 0.504 |
| -1.280000000000037 | 1.52 | 0.76 | 0.507 |
| -1.277500000000037 | 1.527 | 0.763 | 0.509 |
| -1.275000000000037 | 1.534 | 0.767 | 0.511 |
| -1.272500000000037 | 1.541 | 0.771 | 0.514 |
| -1.270000000000037 | 1.548 | 0.774 | 0.516 |
| -1.267500000000037 | 1.556 | 0.778 | 0.519 |
| -1.265000000000037 | 1.563 | 0.782 | 0.521 |
| -1.262500000000037 | 1.571 | 0.785 | 0.524 |
| -1.260000000000037 | 1.578 | 0.789 | 0.526 |
| -1.257500000000037 | 1.586 | 0.793 | 0.529 |
| -1.255000000000037 | 1.594 | 0.797 | 0.531 |
| -1.252500000000037 | 1.601 | 0.801 | 0.534 |
| -1.250000000000037 | 1.609 | 0.805 | 0.536 |
| -1.247500000000037 | 1.617 | 0.809 | 0.539 |
| -1.245000000000037 | 1.626 | 0.813 | 0.542 |
| -1.242500000000037 | 1.634 | 0.817 | 0.545 |
| -1.240000000000037 | 1.642 | 0.821 | 0.547 |
| -1.237500000000038 | 1.651 | 0.825 | 0.55 |
| -1.235000000000038 | 1.659 | 0.83 | 0.553 |
| -1.232500000000038 | 1.668 | 0.834 | 0.556 |
| -1.230000000000038 | 1.677 | 0.838 | 0.559 |
| -1.227500000000038 | 1.686 | 0.843 | 0.562 |
| -1.225000000000038 | 1.695 | 0.847 | 0.565 |
| -1.222500000000038 | 1.704 | 0.852 | 0.568 |
| -1.220000000000038 | 1.713 | 0.856 | 0.571 |
| -1.217500000000038 | 1.722 | 0.861 | 0.574 |
| -1.215000000000038 | 1.732 | 0.866 | 0.577 |
| -1.212500000000038 | 1.741 | 0.871 | 0.58 |
| -1.210000000000038 | 1.751 | 0.876 | 0.584 |
| -1.207500000000038 | 1.761 | 0.881 | 0.587 |
| -1.205000000000038 | 1.771 | 0.886 | 0.59 |
| -1.202500000000038 | 1.781 | 0.891 | 0.594 |
| -1.200000000000038 | 1.792 | 0.896 | 0.597 |
| -1.197500000000038 | 1.802 | 0.901 | 0.601 |
| -1.195000000000038 | 1.813 | 0.906 | 0.604 |
| -1.192500000000038 | 1.824 | 0.912 | 0.608 |
| -1.190000000000039 | 1.835 | 0.917 | 0.612 |
| -1.187500000000039 | 1.846 | 0.923 | 0.615 |
| -1.185000000000039 | 1.857 | 0.929 | 0.619 |
| -1.182500000000039 | 1.869 | 0.934 | 0.623 |
| -1.180000000000039 | 1.88 | 0.94 | 0.627 |
| -1.177500000000039 | 1.892 | 0.946 | 0.631 |
| -1.175000000000039 | 1.904 | 0.952 | 0.635 |
| -1.172500000000039 | 1.916 | 0.958 | 0.639 |
| -1.170000000000039 | 1.929 | 0.964 | 0.643 |
| -1.16750000000004 | 1.942 | 0.971 | 0.647 |
| -1.16500000000004 | 1.955 | 0.977 | 0.652 |
| -1.16250000000004 | 1.968 | 0.984 | 0.656 |
| -1.16000000000004 | 1.981 | 0.991 | 0.66 |
| -1.157500000000039 | 1.995 | 0.997 | 0.665 |
| -1.155000000000039 | 2.008 | 1.004 | 0.669 |
| -1.152500000000039 | 2.023 | 1.011 | 0.674 |
| -1.150000000000039 | 2.037 | 1.018 | 0.679 |
| -1.147500000000039 | 2.052 | 1.026 | 0.684 |
| -1.14500000000004 | 2.066 | 1.033 | 0.689 |
| -1.14250000000004 | 2.082 | 1.041 | 0.694 |
| -1.14000000000004 | 2.097 | 1.049 | 0.699 |
| -1.13750000000004 | 2.113 | 1.056 | 0.704 |
| -1.13500000000004 | 2.129 | 1.065 | 0.71 |
| -1.13250000000004 | 2.146 | 1.073 | 0.715 |
| -1.13000000000004 | 2.162 | 1.081 | 0.721 |
| -1.12750000000004 | 2.18 | 1.09 | 0.727 |
| -1.12500000000004 | 2.197 | 1.099 | 0.732 |
| -1.12250000000004 | 2.215 | 1.108 | 0.738 |
| -1.12000000000004 | 2.234 | 1.117 | 0.745 |
| -1.11750000000004 | 2.252 | 1.126 | 0.751 |
| -1.11500000000004 | 2.272 | 1.136 | 0.757 |
| -1.11250000000004 | 2.291 | 1.146 | 0.764 |
| -1.11000000000004 | 2.312 | 1.156 | 0.771 |
| -1.10750000000004 | 2.332 | 1.166 | 0.777 |
| -1.10500000000004 | 2.354 | 1.177 | 0.785 |
| -1.10250000000004 | 2.375 | 1.188 | 0.792 |
| -1.10000000000004 | 2.398 | 1.199 | 0.799 |
| -1.097500000000041 | 2.421 | 1.21 | 0.807 |
| -1.095000000000041 | 2.445 | 1.222 | 0.815 |
| -1.092500000000041 | 2.469 | 1.235 | 0.823 |
| -1.090000000000041 | 2.494 | 1.247 | 0.831 |
| -1.087500000000041 | 2.52 | 1.26 | 0.84 |
| -1.085000000000041 | 2.547 | 1.273 | 0.849 |
| -1.082500000000041 | 2.574 | 1.287 | 0.858 |
| -1.080000000000041 | 2.603 | 1.301 | 0.868 |
| -1.077500000000041 | 2.632 | 1.316 | 0.877 |
| -1.075000000000041 | 2.663 | 1.331 | 0.888 |
| -1.072500000000041 | 2.694 | 1.347 | 0.898 |
| -1.070000000000041 | 2.727 | 1.363 | 0.909 |
| -1.067500000000041 | 2.761 | 1.38 | 0.92 |
| -1.065000000000041 | 2.796 | 1.398 | 0.932 |
| -1.062500000000041 | 2.833 | 1.417 | 0.944 |
| -1.060000000000041 | 2.872 | 1.436 | 0.957 |
| -1.057500000000041 | 2.912 | 1.456 | 0.971 |
| -1.055000000000041 | 2.954 | 1.477 | 0.985 |
| -1.052500000000042 | 2.998 | 1.499 | 0.999 |
| -1.050000000000042 | 3.045 | 1.522 | 1.015 |
| -1.047500000000042 | 3.093 | 1.547 | 1.031 |
| -1.045000000000042 | 3.145 | 1.573 | 1.048 |
| -1.042500000000042 | 3.2 | 1.6 | 1.067 |
| -1.040000000000042 | 3.258 | 1.629 | 1.086 |
| -1.037500000000042 | 3.32 | 1.66 | 1.107 |
| -1.035000000000042 | 3.387 | 1.693 | 1.129 |
| -1.032500000000042 | 3.458 | 1.729 | 1.153 |
| -1.030000000000042 | 3.536 | 1.768 | 1.179 |
| -1.027500000000042 | 3.621 | 1.81 | 1.207 |
| -1.025000000000042 | 3.714 | 1.857 | 1.238 |
| -1.022500000000042 | 3.816 | 1.908 | 1.272 |
| -1.020000000000042 | 3.932 | 1.966 | 1.311 |
| -1.017500000000042 | 4.063 | 2.031 | 1.354 |
| -1.015000000000042 | 4.215 | 2.107 | 1.405 |
| -1.012500000000042 | 4.394 | 2.197 | 1.465 |
| -1.010000000000042 | 4.615 | 2.308 | 1.538 |
| -1.007500000000042 | 4.9 | 2.45 | 1.633 |
| -1.005000000000043 | 5.303 | 2.652 | 1.768 |
| -1.002500000000043 | 5.994 | 2.997 | 1.998 |
| -1.000000000000043 | 30.786 | 15.393 | 10.262 |
| -0.997500000000043 | 5.989 | 2.994 | 1.996 |
| -0.995000000000043 | 5.293 | 2.647 | 1.764 |
| -0.992500000000043 | 4.885 | 2.443 | 1.628 |
| -0.990000000000043 | 4.595 | 2.298 | 1.532 |
| -0.987500000000043 | 4.369 | 2.185 | 1.456 |
| -0.985000000000043 | 4.185 | 2.092 | 1.395 |
| -0.982500000000043 | 4.028 | 2.014 | 1.343 |
| -0.980000000000043 | 3.892 | 1.946 | 1.297 |
| -0.977500000000043 | 3.771 | 1.886 | 1.257 |
| -0.975000000000043 | 3.664 | 1.832 | 1.221 |
| -0.972500000000043 | 3.566 | 1.783 | 1.189 |
| -0.970000000000043 | 3.476 | 1.738 | 1.159 |
| -0.967500000000043 | 3.393 | 1.697 | 1.131 |
| -0.965000000000043 | 3.317 | 1.658 | 1.106 |
| -0.962500000000043 | 3.245 | 1.623 | 1.082 |
| -0.960000000000043 | 3.178 | 1.589 | 1.059 |
| -0.957500000000044 | 3.115 | 1.557 | 1.038 |
| -0.955000000000044 | 3.055 | 1.528 | 1.018 |
| -0.952500000000044 | 2.998 | 1.499 | 0.999 |
| -0.950000000000044 | 2.944 | 1.472 | 0.981 |
| -0.947500000000044 | 2.893 | 1.447 | 0.964 |
| -0.945000000000044 | 2.844 | 1.422 | 0.948 |
| -0.942500000000044 | 2.797 | 1.398 | 0.932 |
| -0.940000000000044 | 2.752 | 1.376 | 0.917 |
| -0.937500000000044 | 2.708 | 1.354 | 0.903 |
| -0.935000000000044 | 2.666 | 1.333 | 0.889 |
| -0.932500000000044 | 2.626 | 1.313 | 0.875 |
| -0.930000000000044 | 2.587 | 1.293 | 0.862 |
| -0.927500000000044 | 2.549 | 1.274 | 0.85 |
| -0.925000000000044 | 2.512 | 1.256 | 0.837 |
| -0.922500000000044 | 2.477 | 1.238 | 0.826 |
| -0.920000000000044 | 2.442 | 1.221 | 0.814 |
| -0.917500000000044 | 2.409 | 1.204 | 0.803 |
| -0.915000000000044 | 2.376 | 1.188 | 0.792 |
| -0.912500000000044 | 2.345 | 1.172 | 0.782 |
| -0.910000000000045 | 2.314 | 1.157 | 0.771 |
| -0.907500000000045 | 2.283 | 1.142 | 0.761 |
| -0.905000000000045 | 2.254 | 1.127 | 0.751 |
| -0.902500000000045 | 2.225 | 1.113 | 0.742 |
| -0.900000000000045 | 2.197 | 1.099 | 0.732 |
| -0.897500000000045 | 2.17 | 1.085 | 0.723 |
| -0.895000000000045 | 2.143 | 1.071 | 0.714 |
| -0.892500000000045 | 2.117 | 1.058 | 0.706 |
| -0.890000000000045 | 2.091 | 1.045 | 0.697 |
| -0.887500000000045 | 2.065 | 1.033 | 0.688 |
| -0.885000000000045 | 2.041 | 1.02 | 0.68 |
| -0.882500000000045 | 2.016 | 1.008 | 0.672 |
| -0.880000000000045 | 1.992 | 0.996 | 0.664 |
| -0.877500000000045 | 1.969 | 0.984 | 0.656 |
| -0.875000000000045 | 1.946 | 0.973 | 0.649 |
| -0.872500000000045 | 1.923 | 0.962 | 0.641 |
| -0.870000000000045 | 1.901 | 0.95 | 0.634 |
| -0.867500000000045 | 1.879 | 0.94 | 0.626 |
| -0.865000000000045 | 1.857 | 0.929 | 0.619 |
| -0.862500000000046 | 1.836 | 0.918 | 0.612 |
| -0.860000000000046 | 1.815 | 0.908 | 0.605 |
| -0.857500000000046 | 1.795 | 0.897 | 0.598 |
| -0.855000000000046 | 1.774 | 0.887 | 0.591 |
| -0.852500000000046 | 1.754 | 0.877 | 0.585 |
| -0.850000000000046 | 1.735 | 0.867 | 0.578 |
| -0.847500000000046 | 1.715 | 0.858 | 0.572 |
| -0.845000000000046 | 1.696 | 0.848 | 0.565 |
| -0.842500000000046 | 1.677 | 0.838 | 0.559 |
| -0.840000000000046 | 1.658 | 0.829 | 0.553 |
| -0.837500000000046 | 1.64 | 0.82 | 0.547 |
| -0.835000000000046 | 1.621 | 0.811 | 0.54 |
| -0.832500000000046 | 1.603 | 0.802 | 0.534 |
| -0.830000000000046 | 1.586 | 0.793 | 0.529 |
| -0.827500000000046 | 1.568 | 0.784 | 0.523 |
| -0.825000000000046 | 1.551 | 0.775 | 0.517 |
| -0.822500000000046 | 1.533 | 0.767 | 0.511 |
| -0.820000000000046 | 1.516 | 0.758 | 0.505 |
| -0.817500000000046 | 1.5 | 0.75 | 0.5 |
| -0.815000000000047 | 1.483 | 0.741 | 0.494 |
| -0.812500000000047 | 1.466 | 0.733 | 0.489 |
| -0.810000000000047 | 1.45 | 0.725 | 0.483 |
| -0.807500000000047 | 1.434 | 0.717 | 0.478 |
| -0.805000000000047 | 1.418 | 0.709 | 0.473 |
| -0.802500000000047 | 1.402 | 0.701 | 0.467 |
| -0.800000000000047 | 1.386 | 0.693 | 0.462 |
| -0.797500000000047 | 1.371 | 0.685 | 0.457 |
| -0.795000000000047 | 1.355 | 0.678 | 0.452 |
| -0.792500000000047 | 1.34 | 0.67 | 0.447 |
| -0.790000000000047 | 1.325 | 0.662 | 0.442 |
| -0.787500000000047 | 1.31 | 0.655 | 0.437 |
| -0.785000000000047 | 1.295 | 0.648 | 0.432 |
| -0.782500000000047 | 1.28 | 0.64 | 0.427 |
| -0.780000000000047 | 1.266 | 0.633 | 0.422 |
| -0.777500000000047 | 1.251 | 0.626 | 0.417 |
| -0.775000000000047 | 1.237 | 0.618 | 0.412 |
| -0.772500000000047 | 1.222 | 0.611 | 0.407 |
| -0.770000000000047 | 1.208 | 0.604 | 0.403 |
| -0.767500000000048 | 1.194 | 0.597 | 0.398 |
| -0.765000000000048 | 1.18 | 0.59 | 0.393 |
| -0.762500000000048 | 1.166 | 0.583 | 0.389 |
| -0.760000000000048 | 1.153 | 0.576 | 0.384 |
| -0.757500000000048 | 1.139 | 0.57 | 0.38 |
| -0.755000000000048 | 1.125 | 0.563 | 0.375 |
| -0.752500000000048 | 1.112 | 0.556 | 0.371 |
| -0.750000000000048 | 1.099 | 0.549 | 0.366 |
| -0.747500000000048 | 1.085 | 0.543 | 0.362 |
| -0.745000000000048 | 1.072 | 0.536 | 0.357 |
| -0.742500000000048 | 1.059 | 0.53 | 0.353 |
| -0.740000000000048 | 1.046 | 0.523 | 0.349 |
| -0.737500000000048 | 1.033 | 0.517 | 0.344 |
| -0.735000000000048 | 1.02 | 0.51 | 0.34 |
| -0.732500000000048 | 1.007 | 0.504 | 0.336 |
| -0.730000000000048 | 0.995 | 0.497 | 0.332 |
| -0.727500000000048 | 0.982 | 0.491 | 0.327 |
| -0.725000000000048 | 0.969 | 0.485 | 0.323 |
| -0.722500000000048 | 0.957 | 0.478 | 0.319 |
| -0.720000000000049 | 0.944 | 0.472 | 0.315 |
| -0.717500000000049 | 0.932 | 0.466 | 0.311 |
| -0.715000000000049 | 0.92 | 0.46 | 0.307 |
| -0.712500000000049 | 0.908 | 0.454 | 0.303 |
| -0.710000000000049 | 0.895 | 0.448 | 0.298 |
| -0.707500000000049 | 0.883 | 0.442 | 0.294 |
| -0.705000000000049 | 0.871 | 0.436 | 0.29 |
| -0.702500000000049 | 0.859 | 0.43 | 0.286 |
| -0.700000000000049 | 0.847 | 0.424 | 0.282 |
| -0.697500000000049 | 0.835 | 0.418 | 0.278 |
| -0.695000000000049 | 0.824 | 0.412 | 0.275 |
| -0.692500000000049 | 0.812 | 0.406 | 0.271 |
| -0.690000000000049 | 0.8 | 0.4 | 0.267 |
| -0.687500000000049 | 0.788 | 0.394 | 0.263 |
| -0.685000000000049 | 0.777 | 0.388 | 0.259 |
| -0.682500000000049 | 0.765 | 0.383 | 0.255 |
| -0.680000000000049 | 0.754 | 0.377 | 0.251 |
| -0.677500000000049 | 0.742 | 0.371 | 0.247 |
| -0.675000000000049 | 0.731 | 0.365 | 0.244 |
| -0.67250000000005 | 0.72 | 0.36 | 0.24 |
| -0.67000000000005 | 0.708 | 0.354 | 0.236 |
| -0.66750000000005 | 0.697 | 0.348 | 0.232 |
| -0.66500000000005 | 0.686 | 0.343 | 0.229 |
| -0.66250000000005 | 0.674 | 0.337 | 0.225 |
| -0.66000000000005 | 0.663 | 0.332 | 0.221 |
| -0.65750000000005 | 0.652 | 0.326 | 0.217 |
| -0.65500000000005 | 0.641 | 0.321 | 0.214 |
| -0.65250000000005 | 0.63 | 0.315 | 0.21 |
| -0.65000000000005 | 0.619 | 0.31 | 0.206 |
| -0.64750000000005 | 0.608 | 0.304 | 0.203 |
| -0.64500000000005 | 0.597 | 0.299 | 0.199 |
| -0.64250000000005 | 0.586 | 0.293 | 0.195 |
| -0.64000000000005 | 0.575 | 0.288 | 0.192 |
| -0.63750000000005 | 0.565 | 0.282 | 0.188 |
| -0.63500000000005 | 0.554 | 0.277 | 0.185 |
| -0.63250000000005 | 0.543 | 0.271 | 0.181 |
| -0.63000000000005 | 0.532 | 0.266 | 0.177 |
| -0.62750000000005 | 0.522 | 0.261 | 0.174 |
| -0.625000000000051 | 0.511 | 0.255 | 0.17 |
| -0.622500000000051 | 0.5 | 0.25 | 0.167 |
| -0.620000000000051 | 0.49 | 0.245 | 0.163 |
| -0.617500000000051 | 0.479 | 0.239 | 0.16 |
| -0.615000000000051 | 0.468 | 0.234 | 0.156 |
| -0.612500000000051 | 0.458 | 0.229 | 0.153 |
| -0.610000000000051 | 0.447 | 0.224 | 0.149 |
| -0.607500000000051 | 0.437 | 0.218 | 0.146 |
| -0.605000000000051 | 0.426 | 0.213 | 0.142 |
| -0.602500000000051 | 0.416 | 0.208 | 0.139 |
| -0.600000000000051 | 0.405 | 0.203 | 0.135 |
| -0.597500000000051 | 0.395 | 0.198 | 0.132 |
| -0.595000000000051 | 0.385 | 0.192 | 0.128 |
| -0.592500000000051 | 0.374 | 0.187 | 0.125 |
| -0.590000000000051 | 0.364 | 0.182 | 0.121 |
| -0.587500000000051 | 0.354 | 0.177 | 0.118 |
| -0.585000000000051 | 0.343 | 0.172 | 0.114 |
| -0.582500000000052 | 0.333 | 0.167 | 0.111 |
| -0.580000000000052 | 0.323 | 0.161 | 0.108 |
| -0.577500000000052 | 0.313 | 0.156 | 0.104 |
| -0.575000000000052 | 0.302 | 0.151 | 0.101 |
| -0.572500000000052 | 0.292 | 0.146 | 0.097 |
| -0.570000000000052 | 0.282 | 0.141 | 0.094 |
| -0.567500000000052 | 0.272 | 0.136 | 0.091 |
| -0.565000000000052 | 0.261 | 0.131 | 0.087 |
| -0.562500000000052 | 0.251 | 0.126 | 0.084 |
| -0.560000000000052 | 0.241 | 0.121 | 0.08 |
| -0.557500000000052 | 0.231 | 0.116 | 0.077 |
| -0.555000000000052 | 0.221 | 0.11 | 0.074 |
| -0.552500000000052 | 0.211 | 0.105 | 0.07 |
| -0.550000000000052 | 0.201 | 0.1 | 0.067 |
| -0.547500000000052 | 0.191 | 0.095 | 0.064 |
| -0.545000000000052 | 0.18 | 0.09 | 0.06 |
| -0.542500000000052 | 0.17 | 0.085 | 0.057 |
| -0.540000000000052 | 0.16 | 0.08 | 0.053 |
| -0.537500000000052 | 0.15 | 0.075 | 0.05 |
| -0.535000000000053 | 0.14 | 0.07 | 0.047 |
| -0.532500000000053 | 0.13 | 0.065 | 0.043 |
| -0.530000000000053 | 0.12 | 0.06 | 0.04 |
| -0.527500000000053 | 0.11 | 0.055 | 0.037 |
| -0.525000000000053 | 0.1 | 0.05 | 0.033 |
| -0.522500000000053 | 0.09 | 0.045 | 0.03 |
| -0.520000000000053 | 0.08 | 0.04 | 0.027 |
| -0.517500000000053 | 0.07 | 0.035 | 0.023 |
| -0.515000000000053 | 0.06 | 0.03 | 0.02 |
| -0.512500000000053 | 0.05 | 0.025 | 0.017 |
| -0.510000000000053 | 0.04 | 0.02 | 0.013 |
| -0.507500000000053 | 0.03 | 0.015 | 0.01 |
| -0.505000000000053 | 0.02 | 0.01 | 0.007 |
| -0.502500000000053 | 0.01 | 0.005 | 0.003 |
| -0.500000000000053 | 0 | 0 | 0 |
| -0.497500000000053 | -0.01 | -0.005 | -0.003 |
| -0.495000000000053 | -0.02 | -0.01 | -0.007 |
| -0.492500000000053 | -0.03 | -0.015 | -0.01 |
| -0.490000000000053 | -0.04 | -0.02 | -0.013 |
| -0.487500000000053 | -0.05 | -0.025 | -0.017 |
| -0.485000000000053 | -0.06 | -0.03 | -0.02 |
| -0.482500000000053 | -0.07 | -0.035 | -0.023 |
| -0.480000000000053 | -0.08 | -0.04 | -0.027 |
| -0.477500000000053 | -0.09 | -0.045 | -0.03 |
| -0.475000000000053 | -0.1 | -0.05 | -0.033 |
| -0.472500000000053 | -0.11 | -0.055 | -0.037 |
| -0.470000000000053 | -0.12 | -0.06 | -0.04 |
| -0.467500000000053 | -0.13 | -0.065 | -0.043 |
| -0.465000000000053 | -0.14 | -0.07 | -0.047 |
| -0.462500000000053 | -0.15 | -0.075 | -0.05 |
| -0.460000000000053 | -0.16 | -0.08 | -0.053 |
| -0.457500000000053 | -0.17 | -0.085 | -0.057 |
| -0.455000000000053 | -0.18 | -0.09 | -0.06 |
| -0.452500000000053 | -0.191 | -0.095 | -0.064 |
| -0.450000000000053 | -0.201 | -0.1 | -0.067 |
| -0.447500000000053 | -0.211 | -0.105 | -0.07 |
| -0.445000000000053 | -0.221 | -0.11 | -0.074 |
| -0.442500000000053 | -0.231 | -0.116 | -0.077 |
| -0.440000000000053 | -0.241 | -0.121 | -0.08 |
| -0.437500000000053 | -0.251 | -0.126 | -0.084 |
| -0.435000000000053 | -0.261 | -0.131 | -0.087 |
| -0.432500000000053 | -0.272 | -0.136 | -0.091 |
| -0.430000000000053 | -0.282 | -0.141 | -0.094 |
| -0.427500000000053 | -0.292 | -0.146 | -0.097 |
| -0.425000000000053 | -0.302 | -0.151 | -0.101 |
| -0.422500000000053 | -0.313 | -0.156 | -0.104 |
| -0.420000000000053 | -0.323 | -0.161 | -0.108 |
| -0.417500000000053 | -0.333 | -0.167 | -0.111 |
| -0.415000000000053 | -0.343 | -0.172 | -0.114 |
| -0.412500000000053 | -0.354 | -0.177 | -0.118 |
| -0.410000000000053 | -0.364 | -0.182 | -0.121 |
| -0.407500000000053 | -0.374 | -0.187 | -0.125 |
| -0.405000000000053 | -0.385 | -0.192 | -0.128 |
| -0.402500000000053 | -0.395 | -0.198 | -0.132 |
| -0.400000000000053 | -0.405 | -0.203 | -0.135 |
| -0.397500000000053 | -0.416 | -0.208 | -0.139 |
| -0.395000000000053 | -0.426 | -0.213 | -0.142 |
| -0.392500000000053 | -0.437 | -0.218 | -0.146 |
| -0.390000000000053 | -0.447 | -0.224 | -0.149 |
| -0.387500000000053 | -0.458 | -0.229 | -0.153 |
| -0.385000000000053 | -0.468 | -0.234 | -0.156 |
| -0.382500000000053 | -0.479 | -0.239 | -0.16 |
| -0.380000000000053 | -0.49 | -0.245 | -0.163 |
| -0.377500000000053 | -0.5 | -0.25 | -0.167 |
| -0.375000000000053 | -0.511 | -0.255 | -0.17 |
| -0.372500000000053 | -0.522 | -0.261 | -0.174 |
| -0.370000000000053 | -0.532 | -0.266 | -0.177 |
| -0.367500000000053 | -0.543 | -0.271 | -0.181 |
| -0.365000000000053 | -0.554 | -0.277 | -0.185 |
| -0.362500000000053 | -0.565 | -0.282 | -0.188 |
| -0.360000000000053 | -0.575 | -0.288 | -0.192 |
| -0.357500000000053 | -0.586 | -0.293 | -0.195 |
| -0.355000000000053 | -0.597 | -0.299 | -0.199 |
| -0.352500000000053 | -0.608 | -0.304 | -0.203 |
| -0.350000000000053 | -0.619 | -0.31 | -0.206 |
| -0.347500000000053 | -0.63 | -0.315 | -0.21 |
| -0.345000000000053 | -0.641 | -0.321 | -0.214 |
| -0.342500000000053 | -0.652 | -0.326 | -0.217 |
| -0.340000000000053 | -0.663 | -0.332 | -0.221 |
| -0.337500000000053 | -0.674 | -0.337 | -0.225 |
| -0.335000000000053 | -0.686 | -0.343 | -0.229 |
| -0.332500000000053 | -0.697 | -0.348 | -0.232 |
| -0.330000000000053 | -0.708 | -0.354 | -0.236 |
| -0.327500000000053 | -0.72 | -0.36 | -0.24 |
| -0.325000000000053 | -0.731 | -0.365 | -0.244 |
| -0.322500000000053 | -0.742 | -0.371 | -0.247 |
| -0.320000000000053 | -0.754 | -0.377 | -0.251 |
| -0.317500000000053 | -0.765 | -0.383 | -0.255 |
| -0.315000000000053 | -0.777 | -0.388 | -0.259 |
| -0.312500000000053 | -0.788 | -0.394 | -0.263 |
| -0.310000000000053 | -0.8 | -0.4 | -0.267 |
| -0.307500000000053 | -0.812 | -0.406 | -0.271 |
| -0.305000000000053 | -0.824 | -0.412 | -0.275 |
| -0.302500000000053 | -0.835 | -0.418 | -0.278 |
| -0.300000000000053 | -0.847 | -0.424 | -0.282 |
| -0.297500000000053 | -0.859 | -0.43 | -0.286 |
| -0.295000000000053 | -0.871 | -0.436 | -0.29 |
| -0.292500000000053 | -0.883 | -0.442 | -0.294 |
| -0.290000000000053 | -0.895 | -0.448 | -0.298 |
| -0.287500000000053 | -0.908 | -0.454 | -0.303 |
| -0.285000000000053 | -0.92 | -0.46 | -0.307 |
| -0.282500000000053 | -0.932 | -0.466 | -0.311 |
| -0.280000000000053 | -0.944 | -0.472 | -0.315 |
| -0.277500000000053 | -0.957 | -0.478 | -0.319 |
| -0.275000000000053 | -0.969 | -0.485 | -0.323 |
| -0.272500000000053 | -0.982 | -0.491 | -0.327 |
| -0.270000000000053 | -0.995 | -0.497 | -0.332 |
| -0.267500000000053 | -1.007 | -0.504 | -0.336 |
| -0.265000000000053 | -1.02 | -0.51 | -0.34 |
| -0.262500000000053 | -1.033 | -0.517 | -0.344 |
| -0.260000000000053 | -1.046 | -0.523 | -0.349 |
| -0.257500000000053 | -1.059 | -0.53 | -0.353 |
| -0.255000000000053 | -1.072 | -0.536 | -0.357 |
| -0.252500000000053 | -1.085 | -0.543 | -0.362 |
| -0.250000000000053 | -1.099 | -0.549 | -0.366 |
| -0.247500000000053 | -1.112 | -0.556 | -0.371 |
| -0.245000000000053 | -1.125 | -0.563 | -0.375 |
| -0.242500000000053 | -1.139 | -0.57 | -0.38 |
| -0.240000000000053 | -1.153 | -0.576 | -0.384 |
| -0.237500000000053 | -1.166 | -0.583 | -0.389 |
| -0.235000000000053 | -1.18 | -0.59 | -0.393 |
| -0.232500000000053 | -1.194 | -0.597 | -0.398 |
| -0.230000000000053 | -1.208 | -0.604 | -0.403 |
| -0.227500000000053 | -1.222 | -0.611 | -0.407 |
| -0.225000000000053 | -1.237 | -0.618 | -0.412 |
| -0.222500000000053 | -1.251 | -0.626 | -0.417 |
| -0.220000000000053 | -1.266 | -0.633 | -0.422 |
| -0.217500000000053 | -1.28 | -0.64 | -0.427 |
| -0.215000000000053 | -1.295 | -0.648 | -0.432 |
| -0.212500000000053 | -1.31 | -0.655 | -0.437 |
| -0.210000000000053 | -1.325 | -0.662 | -0.442 |
| -0.207500000000053 | -1.34 | -0.67 | -0.447 |
| -0.205000000000053 | -1.355 | -0.678 | -0.452 |
| -0.202500000000053 | -1.371 | -0.685 | -0.457 |
| -0.200000000000053 | -1.386 | -0.693 | -0.462 |
| -0.197500000000053 | -1.402 | -0.701 | -0.467 |
| -0.195000000000053 | -1.418 | -0.709 | -0.473 |
| -0.192500000000053 | -1.434 | -0.717 | -0.478 |
| -0.190000000000053 | -1.45 | -0.725 | -0.483 |
| -0.187500000000053 | -1.466 | -0.733 | -0.489 |
| -0.185000000000053 | -1.483 | -0.741 | -0.494 |
| -0.182500000000053 | -1.5 | -0.75 | -0.5 |
| -0.180000000000053 | -1.516 | -0.758 | -0.505 |
| -0.177500000000053 | -1.533 | -0.767 | -0.511 |
| -0.175000000000053 | -1.551 | -0.775 | -0.517 |
| -0.172500000000053 | -1.568 | -0.784 | -0.523 |
| -0.170000000000053 | -1.586 | -0.793 | -0.529 |
| -0.167500000000053 | -1.603 | -0.802 | -0.534 |
| -0.165000000000053 | -1.621 | -0.811 | -0.54 |
| -0.162500000000053 | -1.64 | -0.82 | -0.547 |
| -0.160000000000053 | -1.658 | -0.829 | -0.553 |
| -0.157500000000053 | -1.677 | -0.838 | -0.559 |
| -0.155000000000053 | -1.696 | -0.848 | -0.565 |
| -0.152500000000053 | -1.715 | -0.858 | -0.572 |
| -0.150000000000053 | -1.735 | -0.867 | -0.578 |
| -0.147500000000053 | -1.754 | -0.877 | -0.585 |
| -0.145000000000053 | -1.774 | -0.887 | -0.591 |
| -0.142500000000053 | -1.795 | -0.897 | -0.598 |
| -0.140000000000053 | -1.815 | -0.908 | -0.605 |
| -0.137500000000053 | -1.836 | -0.918 | -0.612 |
| -0.135000000000053 | -1.857 | -0.929 | -0.619 |
| -0.132500000000053 | -1.879 | -0.94 | -0.626 |
| -0.130000000000053 | -1.901 | -0.95 | -0.634 |
| -0.127500000000053 | -1.923 | -0.962 | -0.641 |
| -0.125000000000053 | -1.946 | -0.973 | -0.649 |
| -0.122500000000053 | -1.969 | -0.984 | -0.656 |
| -0.120000000000053 | -1.992 | -0.996 | -0.664 |
| -0.117500000000053 | -2.016 | -1.008 | -0.672 |
| -0.115000000000053 | -2.041 | -1.02 | -0.68 |
| -0.112500000000053 | -2.065 | -1.033 | -0.688 |
| -0.110000000000053 | -2.091 | -1.045 | -0.697 |
| -0.107500000000053 | -2.117 | -1.058 | -0.706 |
| -0.105000000000053 | -2.143 | -1.071 | -0.714 |
| -0.102500000000053 | -2.17 | -1.085 | -0.723 |
| -0.100000000000053 | -2.197 | -1.099 | -0.732 |
| -0.0975000000000529 | -2.225 | -1.113 | -0.742 |
| -0.0950000000000529 | -2.254 | -1.127 | -0.751 |
| -0.0925000000000529 | -2.283 | -1.142 | -0.761 |
| -0.0900000000000529 | -2.314 | -1.157 | -0.771 |
| -0.0875000000000529 | -2.345 | -1.172 | -0.782 |
| -0.0850000000000529 | -2.376 | -1.188 | -0.792 |
| -0.0825000000000529 | -2.409 | -1.204 | -0.803 |
| -0.0800000000000529 | -2.442 | -1.221 | -0.814 |
| -0.0775000000000529 | -2.477 | -1.238 | -0.826 |
| -0.0750000000000529 | -2.512 | -1.256 | -0.837 |
| -0.0725000000000529 | -2.549 | -1.274 | -0.85 |
| -0.0700000000000529 | -2.587 | -1.293 | -0.862 |
| -0.0675000000000529 | -2.626 | -1.313 | -0.875 |
| -0.0650000000000529 | -2.666 | -1.333 | -0.889 |
| -0.0625000000000529 | -2.708 | -1.354 | -0.903 |
| -0.0600000000000529 | -2.752 | -1.376 | -0.917 |
| -0.0575000000000529 | -2.797 | -1.398 | -0.932 |
| -0.0550000000000529 | -2.844 | -1.422 | -0.948 |
| -0.0525000000000529 | -2.893 | -1.447 | -0.964 |
| -0.0500000000000529 | -2.944 | -1.472 | -0.981 |
| -0.0475000000000529 | -2.998 | -1.499 | -0.999 |
| -0.0450000000000529 | -3.055 | -1.528 | -1.018 |
| -0.0425000000000529 | -3.115 | -1.557 | -1.038 |
| -0.0400000000000529 | -3.178 | -1.589 | -1.059 |
| -0.0375000000000529 | -3.245 | -1.623 | -1.082 |
| -0.0350000000000529 | -3.317 | -1.658 | -1.106 |
| -0.0325000000000529 | -3.393 | -1.697 | -1.131 |
| -0.0300000000000529 | -3.476 | -1.738 | -1.159 |
| -0.0275000000000529 | -3.566 | -1.783 | -1.189 |
| -0.0250000000000529 | -3.664 | -1.832 | -1.221 |
| -0.0225000000000529 | -3.771 | -1.886 | -1.257 |
| -0.0200000000000529 | -3.892 | -1.946 | -1.297 |
| -0.0175000000000529 | -4.028 | -2.014 | -1.343 |
| -0.0150000000000529 | -4.185 | -2.092 | -1.395 |
| -0.0125000000000529 | -4.369 | -2.185 | -1.456 |
| -0.0100000000000529 | -4.595 | -2.298 | -1.532 |
| -0.00750000000005288 | -4.885 | -2.443 | -1.628 |
| -0.00500000000005288 | -5.293 | -2.647 | -1.764 |
| -0.00250000000005288 | -5.989 | -2.994 | -1.996 |
| -5.2880443079939e-14 | -30.571 | -15.285 | -10.19 |
| 0.00249999999994712 | -5.994 | -2.997 | -1.998 |
| 0.00499999999994712 | -5.303 | -2.652 | -1.768 |
| 0.00749999999994712 | -4.9 | -2.45 | -1.633 |
| 0.00999999999994712 | -4.615 | -2.308 | -1.538 |
| 0.0124999999999471 | -4.394 | -2.197 | -1.465 |
| 0.0149999999999471 | -4.215 | -2.107 | -1.405 |
| 0.0174999999999471 | -4.063 | -2.031 | -1.354 |
| 0.0199999999999471 | -3.932 | -1.966 | -1.311 |
| 0.0224999999999471 | -3.816 | -1.908 | -1.272 |
| 0.0249999999999471 | -3.714 | -1.857 | -1.238 |
| 0.0274999999999471 | -3.621 | -1.81 | -1.207 |
| 0.0299999999999471 | -3.536 | -1.768 | -1.179 |
| 0.0324999999999471 | -3.458 | -1.729 | -1.153 |
| 0.0349999999999471 | -3.387 | -1.693 | -1.129 |
| 0.0374999999999471 | -3.32 | -1.66 | -1.107 |
| 0.0399999999999471 | -3.258 | -1.629 | -1.086 |
| 0.0424999999999471 | -3.2 | -1.6 | -1.067 |
| 0.0449999999999471 | -3.145 | -1.573 | -1.048 |
| 0.0474999999999471 | -3.093 | -1.547 | -1.031 |
| 0.0499999999999471 | -3.045 | -1.522 | -1.015 |
| 0.0524999999999471 | -2.998 | -1.499 | -0.999 |
| 0.0549999999999471 | -2.954 | -1.477 | -0.985 |
| 0.0574999999999471 | -2.912 | -1.456 | -0.971 |
| 0.0599999999999471 | -2.872 | -1.436 | -0.957 |
| 0.0624999999999471 | -2.833 | -1.417 | -0.944 |
| 0.0649999999999471 | -2.796 | -1.398 | -0.932 |
| 0.0674999999999471 | -2.761 | -1.38 | -0.92 |
| 0.0699999999999471 | -2.727 | -1.363 | -0.909 |
| 0.0724999999999471 | -2.694 | -1.347 | -0.898 |
| 0.0749999999999471 | -2.663 | -1.331 | -0.888 |
| 0.0774999999999471 | -2.632 | -1.316 | -0.877 |
| 0.0799999999999471 | -2.603 | -1.301 | -0.868 |
| 0.0824999999999471 | -2.574 | -1.287 | -0.858 |
| 0.0849999999999471 | -2.547 | -1.273 | -0.849 |
| 0.0874999999999471 | -2.52 | -1.26 | -0.84 |
| 0.0899999999999471 | -2.494 | -1.247 | -0.831 |
| 0.0924999999999471 | -2.469 | -1.235 | -0.823 |
| 0.0949999999999471 | -2.445 | -1.222 | -0.815 |
| 0.0974999999999471 | -2.421 | -1.21 | -0.807 |
| 0.0999999999999471 | -2.398 | -1.199 | -0.799 |
| 0.102499999999947 | -2.375 | -1.188 | -0.792 |
| 0.104999999999947 | -2.354 | -1.177 | -0.785 |
| 0.107499999999947 | -2.332 | -1.166 | -0.777 |
| 0.109999999999947 | -2.312 | -1.156 | -0.771 |
| 0.112499999999947 | -2.291 | -1.146 | -0.764 |
| 0.114999999999947 | -2.272 | -1.136 | -0.757 |
| 0.117499999999947 | -2.252 | -1.126 | -0.751 |
| 0.119999999999947 | -2.234 | -1.117 | -0.745 |
| 0.122499999999947 | -2.215 | -1.108 | -0.738 |
| 0.124999999999947 | -2.197 | -1.099 | -0.732 |
| 0.127499999999947 | -2.18 | -1.09 | -0.727 |
| 0.129999999999947 | -2.162 | -1.081 | -0.721 |
| 0.132499999999947 | -2.146 | -1.073 | -0.715 |
| 0.134999999999947 | -2.129 | -1.065 | -0.71 |
| 0.137499999999947 | -2.113 | -1.056 | -0.704 |
| 0.139999999999947 | -2.097 | -1.049 | -0.699 |
| 0.142499999999947 | -2.082 | -1.041 | -0.694 |
| 0.144999999999947 | -2.066 | -1.033 | -0.689 |
| 0.147499999999947 | -2.052 | -1.026 | -0.684 |
| 0.149999999999947 | -2.037 | -1.018 | -0.679 |
| 0.152499999999947 | -2.023 | -1.011 | -0.674 |
| 0.154999999999947 | -2.008 | -1.004 | -0.669 |
| 0.157499999999947 | -1.995 | -0.997 | -0.665 |
| 0.159999999999947 | -1.981 | -0.991 | -0.66 |
| 0.162499999999947 | -1.968 | -0.984 | -0.656 |
| 0.164999999999947 | -1.955 | -0.977 | -0.652 |
| 0.167499999999947 | -1.942 | -0.971 | -0.647 |
| 0.169999999999947 | -1.929 | -0.964 | -0.643 |
| 0.172499999999947 | -1.916 | -0.958 | -0.639 |
| 0.174999999999947 | -1.904 | -0.952 | -0.635 |
| 0.177499999999947 | -1.892 | -0.946 | -0.631 |
| 0.179999999999947 | -1.88 | -0.94 | -0.627 |
| 0.182499999999947 | -1.869 | -0.934 | -0.623 |
| 0.184999999999947 | -1.857 | -0.929 | -0.619 |
| 0.187499999999947 | -1.846 | -0.923 | -0.615 |
| 0.189999999999947 | -1.835 | -0.917 | -0.612 |
| 0.192499999999947 | -1.824 | -0.912 | -0.608 |
| 0.194999999999947 | -1.813 | -0.906 | -0.604 |
| 0.197499999999947 | -1.802 | -0.901 | -0.601 |
| 0.199999999999947 | -1.792 | -0.896 | -0.597 |
| 0.202499999999947 | -1.781 | -0.891 | -0.594 |
| 0.204999999999947 | -1.771 | -0.886 | -0.59 |
| 0.207499999999947 | -1.761 | -0.881 | -0.587 |
| 0.209999999999947 | -1.751 | -0.876 | -0.584 |
| 0.212499999999947 | -1.741 | -0.871 | -0.58 |
| 0.214999999999947 | -1.732 | -0.866 | -0.577 |
| 0.217499999999947 | -1.722 | -0.861 | -0.574 |
| 0.219999999999947 | -1.713 | -0.856 | -0.571 |
| 0.222499999999947 | -1.704 | -0.852 | -0.568 |
| 0.224999999999947 | -1.695 | -0.847 | -0.565 |
| 0.227499999999947 | -1.686 | -0.843 | -0.562 |
| 0.229999999999947 | -1.677 | -0.838 | -0.559 |
| 0.232499999999947 | -1.668 | -0.834 | -0.556 |
| 0.234999999999947 | -1.659 | -0.83 | -0.553 |
| 0.237499999999947 | -1.651 | -0.825 | -0.55 |
| 0.239999999999947 | -1.642 | -0.821 | -0.547 |
| 0.242499999999947 | -1.634 | -0.817 | -0.545 |
| 0.244999999999947 | -1.626 | -0.813 | -0.542 |
| 0.247499999999947 | -1.617 | -0.809 | -0.539 |
| 0.249999999999947 | -1.609 | -0.805 | -0.536 |
| 0.252499999999947 | -1.601 | -0.801 | -0.534 |
| 0.254999999999947 | -1.594 | -0.797 | -0.531 |
| 0.257499999999947 | -1.586 | -0.793 | -0.529 |
| 0.259999999999947 | -1.578 | -0.789 | -0.526 |
| 0.262499999999947 | -1.571 | -0.785 | -0.524 |
| 0.264999999999947 | -1.563 | -0.782 | -0.521 |
| 0.267499999999947 | -1.556 | -0.778 | -0.519 |
| 0.269999999999947 | -1.548 | -0.774 | -0.516 |
| 0.272499999999947 | -1.541 | -0.771 | -0.514 |
| 0.274999999999947 | -1.534 | -0.767 | -0.511 |
| 0.277499999999947 | -1.527 | -0.763 | -0.509 |
| 0.279999999999947 | -1.52 | -0.76 | -0.507 |
| 0.282499999999947 | -1.513 | -0.756 | -0.504 |
| 0.284999999999947 | -1.506 | -0.753 | -0.502 |
| 0.287499999999947 | -1.499 | -0.75 | -0.5 |
| 0.289999999999947 | -1.493 | -0.746 | -0.498 |
| 0.292499999999947 | -1.486 | -0.743 | -0.495 |
| 0.294999999999947 | -1.479 | -0.74 | -0.493 |
| 0.297499999999947 | -1.473 | -0.736 | -0.491 |
| 0.299999999999947 | -1.466 | -0.733 | -0.489 |
| 0.302499999999947 | -1.46 | -0.73 | -0.487 |
| 0.304999999999947 | -1.454 | -0.727 | -0.485 |
| 0.307499999999947 | -1.447 | -0.724 | -0.482 |
| 0.309999999999947 | -1.441 | -0.721 | -0.48 |
| 0.312499999999947 | -1.435 | -0.718 | -0.478 |
| 0.314999999999947 | -1.429 | -0.715 | -0.476 |
| 0.317499999999947 | -1.423 | -0.712 | -0.474 |
| 0.319999999999947 | -1.417 | -0.709 | -0.472 |
| 0.322499999999947 | -1.411 | -0.706 | -0.47 |
| 0.324999999999947 | -1.405 | -0.703 | -0.468 |
| 0.327499999999947 | -1.4 | -0.7 | -0.467 |
| 0.329999999999947 | -1.394 | -0.697 | -0.465 |
| 0.332499999999947 | -1.388 | -0.694 | -0.463 |
| 0.334999999999947 | -1.383 | -0.691 | -0.461 |
| 0.337499999999947 | -1.377 | -0.688 | -0.459 |
| 0.339999999999947 | -1.371 | -0.686 | -0.457 |
| 0.342499999999947 | -1.366 | -0.683 | -0.455 |
| 0.344999999999947 | -1.361 | -0.68 | -0.454 |
| 0.347499999999947 | -1.355 | -0.678 | -0.452 |
| 0.349999999999947 | -1.35 | -0.675 | -0.45 |
| 0.352499999999947 | -1.345 | -0.672 | -0.448 |
| 0.354999999999947 | -1.339 | -0.67 | -0.446 |
| 0.357499999999947 | -1.334 | -0.667 | -0.445 |
| 0.359999999999947 | -1.329 | -0.665 | -0.443 |
| 0.362499999999947 | -1.324 | -0.662 | -0.441 |
| 0.364999999999947 | -1.319 | -0.66 | -0.44 |
| 0.367499999999947 | -1.314 | -0.657 | -0.438 |
| 0.369999999999947 | -1.309 | -0.655 | -0.436 |
| 0.372499999999947 | -1.304 | -0.652 | -0.435 |
| 0.374999999999947 | -1.299 | -0.65 | -0.433 |
| 0.377499999999947 | -1.294 | -0.647 | -0.431 |
| 0.379999999999947 | -1.29 | -0.645 | -0.43 |
| 0.382499999999947 | -1.285 | -0.642 | -0.428 |
| 0.384999999999947 | -1.28 | -0.64 | -0.427 |
| 0.387499999999947 | -1.276 | -0.638 | -0.425 |
| 0.389999999999947 | -1.271 | -0.635 | -0.424 |
| 0.392499999999947 | -1.266 | -0.633 | -0.422 |
| 0.394999999999947 | -1.262 | -0.631 | -0.421 |
| 0.397499999999947 | -1.257 | -0.629 | -0.419 |
| 0.399999999999947 | -1.253 | -0.626 | -0.418 |
| 0.402499999999947 | -1.248 | -0.624 | -0.416 |
| 0.404999999999947 | -1.244 | -0.622 | -0.415 |
| 0.407499999999947 | -1.24 | -0.62 | -0.413 |
| 0.409999999999947 | -1.235 | -0.618 | -0.412 |
| 0.412499999999947 | -1.231 | -0.615 | -0.41 |
| 0.414999999999947 | -1.227 | -0.613 | -0.409 |
| 0.417499999999947 | -1.222 | -0.611 | -0.407 |
| 0.419999999999947 | -1.218 | -0.609 | -0.406 |
| 0.422499999999947 | -1.214 | -0.607 | -0.405 |
| 0.424999999999947 | -1.21 | -0.605 | -0.403 |
| 0.427499999999947 | -1.206 | -0.603 | -0.402 |
| 0.429999999999947 | -1.202 | -0.601 | -0.401 |
| 0.432499999999947 | -1.198 | -0.599 | -0.399 |
| 0.434999999999947 | -1.194 | -0.597 | -0.398 |
| 0.437499999999947 | -1.19 | -0.595 | -0.397 |
| 0.439999999999947 | -1.186 | -0.593 | -0.395 |
| 0.442499999999947 | -1.182 | -0.591 | -0.394 |
| 0.444999999999947 | -1.178 | -0.589 | -0.393 |
| 0.447499999999947 | -1.174 | -0.587 | -0.391 |
| 0.449999999999947 | -1.17 | -0.585 | -0.39 |
| 0.452499999999947 | -1.166 | -0.583 | -0.389 |
| 0.454999999999947 | -1.162 | -0.581 | -0.387 |
| 0.457499999999947 | -1.159 | -0.579 | -0.386 |
| 0.459999999999947 | -1.155 | -0.577 | -0.385 |
| 0.462499999999947 | -1.151 | -0.576 | -0.384 |
| 0.464999999999947 | -1.148 | -0.574 | -0.383 |
| 0.467499999999947 | -1.144 | -0.572 | -0.381 |
| 0.469999999999947 | -1.14 | -0.57 | -0.38 |
| 0.472499999999947 | -1.137 | -0.568 | -0.379 |
| 0.474999999999947 | -1.133 | -0.567 | -0.378 |
| 0.477499999999947 | -1.13 | -0.565 | -0.377 |
| 0.479999999999947 | -1.126 | -0.563 | -0.375 |
| 0.482499999999947 | -1.123 | -0.561 | -0.374 |
| 0.484999999999947 | -1.119 | -0.56 | -0.373 |
| 0.487499999999947 | -1.116 | -0.558 | -0.372 |
| 0.489999999999947 | -1.112 | -0.556 | -0.371 |
| 0.492499999999947 | -1.109 | -0.554 | -0.37 |
| 0.494999999999947 | -1.105 | -0.553 | -0.368 |
| 0.497499999999947 | -1.102 | -0.551 | -0.367 |
| 0.499999999999947 | -1.099 | -0.549 | -0.366 |
| 0.502499999999947 | -1.095 | -0.548 | -0.365 |
| 0.504999999999947 | -1.092 | -0.546 | -0.364 |
| 0.507499999999947 | -1.089 | -0.544 | -0.363 |
| 0.509999999999947 | -1.085 | -0.543 | -0.362 |
| 0.512499999999947 | -1.082 | -0.541 | -0.361 |
| 0.514999999999947 | -1.079 | -0.54 | -0.36 |
| 0.517499999999947 | -1.076 | -0.538 | -0.359 |
| 0.519999999999947 | -1.073 | -0.536 | -0.358 |
| 0.522499999999947 | -1.069 | -0.535 | -0.356 |
| 0.524999999999947 | -1.066 | -0.533 | -0.355 |
| 0.527499999999947 | -1.063 | -0.532 | -0.354 |
| 0.529999999999947 | -1.06 | -0.53 | -0.353 |
| 0.532499999999947 | -1.057 | -0.529 | -0.352 |
| 0.534999999999947 | -1.054 | -0.527 | -0.351 |
| 0.537499999999947 | -1.051 | -0.525 | -0.35 |
| 0.539999999999947 | -1.048 | -0.524 | -0.349 |
| 0.542499999999947 | -1.045 | -0.522 | -0.348 |
| 0.544999999999947 | -1.042 | -0.521 | -0.347 |
| 0.547499999999946 | -1.039 | -0.52 | -0.346 |
| 0.549999999999946 | -1.036 | -0.518 | -0.345 |
| 0.552499999999946 | -1.033 | -0.517 | -0.344 |
| 0.554999999999946 | -1.03 | -0.515 | -0.343 |
| 0.557499999999946 | -1.027 | -0.514 | -0.342 |
| 0.559999999999946 | -1.025 | -0.512 | -0.342 |
| 0.562499999999946 | -1.022 | -0.511 | -0.341 |
| 0.564999999999946 | -1.019 | -0.509 | -0.34 |
| 0.567499999999946 | -1.016 | -0.508 | -0.339 |
| 0.569999999999946 | -1.013 | -0.507 | -0.338 |
| 0.572499999999946 | -1.01 | -0.505 | -0.337 |
| 0.574999999999946 | -1.008 | -0.504 | -0.336 |
| 0.577499999999946 | -1.005 | -0.502 | -0.335 |
| 0.579999999999946 | -1.002 | -0.501 | -0.334 |
| 0.582499999999946 | -0.999 | -0.5 | -0.333 |
| 0.584999999999946 | -0.997 | -0.498 | -0.332 |
| 0.587499999999946 | -0.994 | -0.497 | -0.331 |
| 0.589999999999946 | -0.991 | -0.496 | -0.33 |
| 0.592499999999945 | -0.989 | -0.494 | -0.33 |
| 0.594999999999945 | -0.986 | -0.493 | -0.329 |
| 0.597499999999945 | -0.983 | -0.492 | -0.328 |
| 0.599999999999945 | -0.981 | -0.49 | -0.327 |
| 0.602499999999945 | -0.978 | -0.489 | -0.326 |
| 0.604999999999945 | -0.976 | -0.488 | -0.325 |
| 0.607499999999945 | -0.973 | -0.487 | -0.324 |
| 0.609999999999945 | -0.971 | -0.485 | -0.324 |
| 0.612499999999945 | -0.968 | -0.484 | -0.323 |
| 0.614999999999945 | -0.965 | -0.483 | -0.322 |
| 0.617499999999945 | -0.963 | -0.481 | -0.321 |
| 0.619999999999945 | -0.96 | -0.48 | -0.32 |
| 0.622499999999945 | -0.958 | -0.479 | -0.319 |
| 0.624999999999945 | -0.956 | -0.478 | -0.319 |
| 0.627499999999945 | -0.953 | -0.477 | -0.318 |
| 0.629999999999945 | -0.951 | -0.475 | -0.317 |
| 0.632499999999945 | -0.948 | -0.474 | -0.316 |
| 0.634999999999945 | -0.946 | -0.473 | -0.315 |
| 0.637499999999944 | -0.943 | -0.472 | -0.314 |
| 0.639999999999944 | -0.941 | -0.47 | -0.314 |
| 0.642499999999944 | -0.939 | -0.469 | -0.313 |
| 0.644999999999944 | -0.936 | -0.468 | -0.312 |
| 0.647499999999944 | -0.934 | -0.467 | -0.311 |
| 0.649999999999944 | -0.932 | -0.466 | -0.311 |
| 0.652499999999944 | -0.929 | -0.465 | -0.31 |
| 0.654999999999944 | -0.927 | -0.463 | -0.309 |
| 0.657499999999944 | -0.925 | -0.462 | -0.308 |
| 0.659999999999944 | -0.922 | -0.461 | -0.307 |
| 0.662499999999944 | -0.92 | -0.46 | -0.307 |
| 0.664999999999944 | -0.918 | -0.459 | -0.306 |
| 0.667499999999944 | -0.916 | -0.458 | -0.305 |
| 0.669999999999944 | -0.913 | -0.457 | -0.304 |
| 0.672499999999944 | -0.911 | -0.456 | -0.304 |
| 0.674999999999944 | -0.909 | -0.454 | -0.303 |
| 0.677499999999944 | -0.907 | -0.453 | -0.302 |
| 0.679999999999944 | -0.904 | -0.452 | -0.301 |
| 0.682499999999943 | -0.902 | -0.451 | -0.301 |
| 0.684999999999943 | -0.9 | -0.45 | -0.3 |
| 0.687499999999943 | -0.898 | -0.449 | -0.299 |
| 0.689999999999943 | -0.896 | -0.448 | -0.299 |
| 0.692499999999943 | -0.894 | -0.447 | -0.298 |
| 0.694999999999943 | -0.892 | -0.446 | -0.297 |
| 0.697499999999943 | -0.889 | -0.445 | -0.296 |
| 0.699999999999943 | -0.887 | -0.444 | -0.296 |
| 0.702499999999943 | -0.885 | -0.443 | -0.295 |
| 0.704999999999943 | -0.883 | -0.442 | -0.294 |
| 0.707499999999943 | -0.881 | -0.441 | -0.294 |
| 0.709999999999943 | -0.879 | -0.439 | -0.293 |
| 0.712499999999943 | -0.877 | -0.438 | -0.292 |
| 0.714999999999943 | -0.875 | -0.437 | -0.292 |
| 0.717499999999943 | -0.873 | -0.436 | -0.291 |
| 0.719999999999943 | -0.871 | -0.435 | -0.29 |
| 0.722499999999943 | -0.869 | -0.434 | -0.29 |
| 0.724999999999943 | -0.867 | -0.433 | -0.289 |
| 0.727499999999943 | -0.865 | -0.432 | -0.288 |
| 0.729999999999943 | -0.863 | -0.431 | -0.288 |
| 0.732499999999942 | -0.861 | -0.43 | -0.287 |
| 0.734999999999942 | -0.859 | -0.429 | -0.286 |
| 0.737499999999942 | -0.857 | -0.428 | -0.286 |
| 0.739999999999942 | -0.855 | -0.427 | -0.285 |
| 0.742499999999942 | -0.853 | -0.427 | -0.284 |
| 0.744999999999942 | -0.851 | -0.426 | -0.284 |
| 0.747499999999942 | -0.849 | -0.425 | -0.283 |
| 0.749999999999942 | -0.847 | -0.424 | -0.282 |
| 0.752499999999942 | -0.845 | -0.423 | -0.282 |
| 0.754999999999942 | -0.844 | -0.422 | -0.281 |
| 0.757499999999942 | -0.842 | -0.421 | -0.281 |
| 0.759999999999942 | -0.84 | -0.42 | -0.28 |
| 0.762499999999942 | -0.838 | -0.419 | -0.279 |
| 0.764999999999942 | -0.836 | -0.418 | -0.279 |
| 0.767499999999942 | -0.834 | -0.417 | -0.278 |
| 0.769999999999942 | -0.832 | -0.416 | -0.277 |
| 0.772499999999942 | -0.831 | -0.415 | -0.277 |
| 0.774999999999942 | -0.829 | -0.414 | -0.276 |
| 0.777499999999941 | -0.827 | -0.413 | -0.276 |
| 0.779999999999941 | -0.825 | -0.413 | -0.275 |
| 0.782499999999941 | -0.823 | -0.412 | -0.274 |
| 0.784999999999941 | -0.821 | -0.411 | -0.274 |
| 0.787499999999941 | -0.82 | -0.41 | -0.273 |
| 0.789999999999941 | -0.818 | -0.409 | -0.273 |
| 0.792499999999941 | -0.816 | -0.408 | -0.272 |
| 0.794999999999941 | -0.814 | -0.407 | -0.271 |
| 0.797499999999941 | -0.813 | -0.406 | -0.271 |
| 0.799999999999941 | -0.811 | -0.405 | -0.27 |
| 0.802499999999941 | -0.809 | -0.405 | -0.27 |
| 0.804999999999941 | -0.807 | -0.404 | -0.269 |
| 0.807499999999941 | -0.806 | -0.403 | -0.269 |
| 0.809999999999941 | -0.804 | -0.402 | -0.268 |
| 0.812499999999941 | -0.802 | -0.401 | -0.267 |
| 0.814999999999941 | -0.801 | -0.4 | -0.267 |
| 0.817499999999941 | -0.799 | -0.399 | -0.266 |
| 0.819999999999941 | -0.797 | -0.399 | -0.266 |
| 0.822499999999941 | -0.796 | -0.398 | -0.265 |
| 0.824999999999941 | -0.794 | -0.397 | -0.265 |
| 0.82749999999994 | -0.792 | -0.396 | -0.264 |
| 0.82999999999994 | -0.791 | -0.395 | -0.264 |
| 0.83249999999994 | -0.789 | -0.395 | -0.263 |
| 0.83499999999994 | -0.787 | -0.394 | -0.262 |
| 0.83749999999994 | -0.786 | -0.393 | -0.262 |
| 0.83999999999994 | -0.784 | -0.392 | -0.261 |
| 0.84249999999994 | -0.783 | -0.391 | -0.261 |
| 0.84499999999994 | -0.781 | -0.39 | -0.26 |
| 0.84749999999994 | -0.779 | -0.39 | -0.26 |
| 0.84999999999994 | -0.778 | -0.389 | -0.259 |
| 0.85249999999994 | -0.776 | -0.388 | -0.259 |
| 0.85499999999994 | -0.775 | -0.387 | -0.258 |
| 0.85749999999994 | -0.773 | -0.386 | -0.258 |
| 0.85999999999994 | -0.771 | -0.386 | -0.257 |
| 0.86249999999994 | -0.77 | -0.385 | -0.257 |
| 0.86499999999994 | -0.768 | -0.384 | -0.256 |
| 0.86749999999994 | -0.767 | -0.383 | -0.256 |
| 0.86999999999994 | -0.765 | -0.383 | -0.255 |
| 0.872499999999939 | -0.764 | -0.382 | -0.255 |
| 0.874999999999939 | -0.762 | -0.381 | -0.254 |
| 0.877499999999939 | -0.761 | -0.38 | -0.254 |
| 0.879999999999939 | -0.759 | -0.38 | -0.253 |
| 0.882499999999939 | -0.758 | -0.379 | -0.253 |
| 0.884999999999939 | -0.756 | -0.378 | -0.252 |
| 0.887499999999939 | -0.755 | -0.377 | -0.252 |
| 0.889999999999939 | -0.753 | -0.377 | -0.251 |
| 0.892499999999939 | -0.752 | -0.376 | -0.251 |
| 0.894999999999939 | -0.75 | -0.375 | -0.25 |
| 0.897499999999939 | -0.749 | -0.374 | -0.25 |
| 0.899999999999939 | -0.747 | -0.374 | -0.249 |
| 0.902499999999939 | -0.746 | -0.373 | -0.249 |
| 0.904999999999939 | -0.744 | -0.372 | -0.248 |
| 0.907499999999939 | -0.743 | -0.371 | -0.248 |
| 0.909999999999939 | -0.741 | -0.371 | -0.247 |
| 0.912499999999939 | -0.74 | -0.37 | -0.247 |
| 0.914999999999939 | -0.739 | -0.369 | -0.246 |
| 0.917499999999939 | -0.737 | -0.369 | -0.246 |
| 0.919999999999939 | -0.736 | -0.368 | -0.245 |
| 0.922499999999938 | -0.734 | -0.367 | -0.245 |
| 0.924999999999938 | -0.733 | -0.366 | -0.244 |
| 0.927499999999938 | -0.731 | -0.366 | -0.244 |
| 0.929999999999938 | -0.73 | -0.365 | -0.243 |
| 0.932499999999938 | -0.729 | -0.364 | -0.243 |
| 0.934999999999938 | -0.727 | -0.364 | -0.242 |
| 0.937499999999938 | -0.726 | -0.363 | -0.242 |
| 0.939999999999938 | -0.725 | -0.362 | -0.242 |
| 0.942499999999938 | -0.723 | -0.362 | -0.241 |
| 0.944999999999938 | -0.722 | -0.361 | -0.241 |
| 0.947499999999938 | -0.72 | -0.36 | -0.24 |
| 0.949999999999938 | -0.719 | -0.36 | -0.24 |
| 0.952499999999938 | -0.718 | -0.359 | -0.239 |
| 0.954999999999938 | -0.716 | -0.358 | -0.239 |
| 0.957499999999938 | -0.715 | -0.358 | -0.238 |
| 0.959999999999938 | -0.714 | -0.357 | -0.238 |
| 0.962499999999938 | -0.712 | -0.356 | -0.237 |
| 0.964999999999938 | -0.711 | -0.356 | -0.237 |
| 0.967499999999937 | -0.71 | -0.355 | -0.237 |
| 0.969999999999937 | -0.708 | -0.354 | -0.236 |
| 0.972499999999937 | -0.707 | -0.354 | -0.236 |
| 0.974999999999937 | -0.706 | -0.353 | -0.235 |
| 0.977499999999937 | -0.705 | -0.352 | -0.235 |
| 0.979999999999937 | -0.703 | -0.352 | -0.234 |
| 0.982499999999937 | -0.702 | -0.351 | -0.234 |
| 0.984999999999937 | -0.701 | -0.35 | -0.234 |
| 0.987499999999937 | -0.699 | -0.35 | -0.233 |
| 0.989999999999937 | -0.698 | -0.349 | -0.233 |
| 0.992499999999937 | -0.697 | -0.348 | -0.232 |
| 0.994999999999937 | -0.696 | -0.348 | -0.232 |
| 0.997499999999937 | -0.694 | -0.347 | -0.231 |
| 0.999999999999937 | -0.693 | -0.347 | -0.231 |
| 1.002499999999937 | -0.692 | -0.346 | -0.231 |
| 1.004999999999937 | -0.691 | -0.345 | -0.23 |
| 1.007499999999937 | -0.689 | -0.345 | -0.23 |
| 1.009999999999937 | -0.688 | -0.344 | -0.229 |
| 1.012499999999937 | -0.687 | -0.343 | -0.229 |
| 1.014999999999937 | -0.686 | -0.343 | -0.229 |
| 1.017499999999937 | -0.685 | -0.342 | -0.228 |
| 1.019999999999937 | -0.683 | -0.342 | -0.228 |
| 1.022499999999936 | -0.682 | -0.341 | -0.227 |
| 1.024999999999936 | -0.681 | -0.34 | -0.227 |
| 1.027499999999936 | -0.68 | -0.34 | -0.227 |
| 1.029999999999936 | -0.678 | -0.339 | -0.226 |
| 1.032499999999936 | -0.677 | -0.339 | -0.226 |
| 1.034999999999936 | -0.676 | -0.338 | -0.225 |
| 1.037499999999936 | -0.675 | -0.337 | -0.225 |
| 1.039999999999936 | -0.674 | -0.337 | -0.225 |
| 1.042499999999936 | -0.673 | -0.336 | -0.224 |
| 1.044999999999936 | -0.671 | -0.336 | -0.224 |
| 1.047499999999936 | -0.67 | -0.335 | -0.223 |
| 1.049999999999936 | -0.669 | -0.335 | -0.223 |
| 1.052499999999936 | -0.668 | -0.334 | -0.223 |
| 1.054999999999936 | -0.667 | -0.333 | -0.222 |
| 1.057499999999936 | -0.666 | -0.333 | -0.222 |
| 1.059999999999936 | -0.664 | -0.332 | -0.221 |
| 1.062499999999936 | -0.663 | -0.332 | -0.221 |
| 1.064999999999936 | -0.662 | -0.331 | -0.221 |
| 1.067499999999935 | -0.661 | -0.331 | -0.22 |
| 1.069999999999935 | -0.66 | -0.33 | -0.22 |
| 1.072499999999935 | -0.659 | -0.329 | -0.22 |
| 1.074999999999935 | -0.658 | -0.329 | -0.219 |
| 1.077499999999935 | -0.657 | -0.328 | -0.219 |
| 1.079999999999935 | -0.655 | -0.328 | -0.218 |
| 1.082499999999935 | -0.654 | -0.327 | -0.218 |
| 1.084999999999935 | -0.653 | -0.327 | -0.218 |
| 1.087499999999935 | -0.652 | -0.326 | -0.217 |
| 1.089999999999935 | -0.651 | -0.325 | -0.217 |
| 1.092499999999935 | -0.65 | -0.325 | -0.217 |
| 1.094999999999935 | -0.649 | -0.324 | -0.216 |
| 1.097499999999935 | -0.648 | -0.324 | -0.216 |
| 1.099999999999935 | -0.647 | -0.323 | -0.216 |
| 1.102499999999935 | -0.646 | -0.323 | -0.215 |
| 1.104999999999935 | -0.644 | -0.322 | -0.215 |
| 1.107499999999935 | -0.643 | -0.322 | -0.214 |
| 1.109999999999935 | -0.642 | -0.321 | -0.214 |
| 1.112499999999935 | -0.641 | -0.321 | -0.214 |
| 1.114999999999934 | -0.64 | -0.32 | -0.213 |
| 1.117499999999934 | -0.639 | -0.32 | -0.213 |
| 1.119999999999934 | -0.638 | -0.319 | -0.213 |
| 1.122499999999934 | -0.637 | -0.319 | -0.212 |
| 1.124999999999934 | -0.636 | -0.318 | -0.212 |
| 1.127499999999934 | -0.635 | -0.317 | -0.212 |
| 1.129999999999934 | -0.634 | -0.317 | -0.211 |
| 1.132499999999934 | -0.633 | -0.316 | -0.211 |
| 1.134999999999934 | -0.632 | -0.316 | -0.211 |
| 1.137499999999934 | -0.631 | -0.315 | -0.21 |
| 1.139999999999934 | -0.63 | -0.315 | -0.21 |
| 1.142499999999934 | -0.629 | -0.314 | -0.21 |
| 1.144999999999934 | -0.628 | -0.314 | -0.209 |
| 1.147499999999934 | -0.627 | -0.313 | -0.209 |
| 1.149999999999934 | -0.626 | -0.313 | -0.209 |
| 1.152499999999934 | -0.625 | -0.312 | -0.208 |
| 1.154999999999934 | -0.624 | -0.312 | -0.208 |
| 1.157499999999934 | -0.623 | -0.311 | -0.208 |
| 1.159999999999934 | -0.622 | -0.311 | -0.207 |
| 1.162499999999933 | -0.621 | -0.31 | -0.207 |
| 1.164999999999933 | -0.62 | -0.31 | -0.207 |
| 1.167499999999933 | -0.619 | -0.309 | -0.206 |
| 1.169999999999933 | -0.618 | -0.309 | -0.206 |
| 1.172499999999933 | -0.617 | -0.308 | -0.206 |
| 1.174999999999933 | -0.616 | -0.308 | -0.205 |
| 1.177499999999933 | -0.615 | -0.307 | -0.205 |
| 1.179999999999933 | -0.614 | -0.307 | -0.205 |
| 1.182499999999933 | -0.613 | -0.306 | -0.204 |
| 1.184999999999933 | -0.612 | -0.306 | -0.204 |
| 1.187499999999933 | -0.611 | -0.305 | -0.204 |
| 1.189999999999933 | -0.61 | -0.305 | -0.203 |
| 1.192499999999933 | -0.609 | -0.304 | -0.203 |
| 1.194999999999933 | -0.608 | -0.304 | -0.203 |
| 1.197499999999933 | -0.607 | -0.304 | -0.202 |
| 1.199999999999933 | -0.606 | -0.303 | -0.202 |
| 1.202499999999933 | -0.605 | -0.303 | -0.202 |
| 1.204999999999933 | -0.604 | -0.302 | -0.201 |
| 1.207499999999933 | -0.603 | -0.302 | -0.201 |
| 1.209999999999932 | -0.602 | -0.301 | -0.201 |
| 1.212499999999932 | -0.601 | -0.301 | -0.2 |
| 1.214999999999932 | -0.601 | -0.3 | -0.2 |
| 1.217499999999932 | -0.6 | -0.3 | -0.2 |
| 1.219999999999932 | -0.599 | -0.299 | -0.2 |
| 1.222499999999932 | -0.598 | -0.299 | -0.199 |
| 1.224999999999932 | -0.597 | -0.298 | -0.199 |
| 1.227499999999932 | -0.596 | -0.298 | -0.199 |
| 1.229999999999932 | -0.595 | -0.297 | -0.198 |
| 1.232499999999932 | -0.594 | -0.297 | -0.198 |
| 1.234999999999932 | -0.593 | -0.297 | -0.198 |
| 1.237499999999932 | -0.592 | -0.296 | -0.197 |
| 1.239999999999932 | -0.591 | -0.296 | -0.197 |
| 1.242499999999932 | -0.59 | -0.295 | -0.197 |
| 1.244999999999932 | -0.59 | -0.295 | -0.197 |
| 1.247499999999932 | -0.589 | -0.294 | -0.196 |
| 1.249999999999932 | -0.588 | -0.294 | -0.196 |
| 1.252499999999932 | -0.587 | -0.293 | -0.196 |
| 1.254999999999931 | -0.586 | -0.293 | -0.195 |
| 1.257499999999931 | -0.585 | -0.293 | -0.195 |
| 1.259999999999931 | -0.584 | -0.292 | -0.195 |
| 1.262499999999931 | -0.583 | -0.292 | -0.194 |
| 1.264999999999931 | -0.583 | -0.291 | -0.194 |
| 1.267499999999931 | -0.582 | -0.291 | -0.194 |
| 1.269999999999931 | -0.581 | -0.29 | -0.194 |
| 1.272499999999931 | -0.58 | -0.29 | -0.193 |
| 1.274999999999931 | -0.579 | -0.29 | -0.193 |
| 1.277499999999931 | -0.578 | -0.289 | -0.193 |
| 1.279999999999931 | -0.577 | -0.289 | -0.192 |
| 1.282499999999931 | -0.576 | -0.288 | -0.192 |
| 1.284999999999931 | -0.576 | -0.288 | -0.192 |
| 1.287499999999931 | -0.575 | -0.287 | -0.192 |
| 1.289999999999931 | -0.574 | -0.287 | -0.191 |
| 1.292499999999931 | -0.573 | -0.287 | -0.191 |
| 1.294999999999931 | -0.572 | -0.286 | -0.191 |
| 1.297499999999931 | -0.571 | -0.286 | -0.19 |
| 1.299999999999931 | -0.571 | -0.285 | -0.19 |
| 1.30249999999993 | -0.57 | -0.285 | -0.19 |
| 1.30499999999993 | -0.569 | -0.284 | -0.19 |
| 1.30749999999993 | -0.568 | -0.284 | -0.189 |
| 1.30999999999993 | -0.567 | -0.284 | -0.189 |
| 1.31249999999993 | -0.566 | -0.283 | -0.189 |
| 1.31499999999993 | -0.566 | -0.283 | -0.189 |
| 1.31749999999993 | -0.565 | -0.282 | -0.188 |
| 1.31999999999993 | -0.564 | -0.282 | -0.188 |
| 1.32249999999993 | -0.563 | -0.282 | -0.188 |
| 1.32499999999993 | -0.562 | -0.281 | -0.187 |
| 1.32749999999993 | -0.561 | -0.281 | -0.187 |
| 1.32999999999993 | -0.561 | -0.28 | -0.187 |
| 1.33249999999993 | -0.56 | -0.28 | -0.187 |
| 1.33499999999993 | -0.559 | -0.28 | -0.186 |
| 1.33749999999993 | -0.558 | -0.279 | -0.186 |
| 1.33999999999993 | -0.557 | -0.279 | -0.186 |
| 1.34249999999993 | -0.557 | -0.278 | -0.186 |
| 1.34499999999993 | -0.556 | -0.278 | -0.185 |
| 1.347499999999929 | -0.555 | -0.278 | -0.185 |
| 1.349999999999929 | -0.554 | -0.277 | -0.185 |
| 1.352499999999929 | -0.554 | -0.277 | -0.185 |
| 1.354999999999929 | -0.553 | -0.276 | -0.184 |
| 1.357499999999929 | -0.552 | -0.276 | -0.184 |
| 1.359999999999929 | -0.551 | -0.276 | -0.184 |
| 1.362499999999929 | -0.55 | -0.275 | -0.183 |
| 1.364999999999929 | -0.55 | -0.275 | -0.183 |
| 1.367499999999929 | -0.549 | -0.274 | -0.183 |
| 1.369999999999929 | -0.548 | -0.274 | -0.183 |
| 1.372499999999929 | -0.547 | -0.274 | -0.182 |
| 1.374999999999929 | -0.547 | -0.273 | -0.182 |
| 1.377499999999929 | -0.546 | -0.273 | -0.182 |
| 1.379999999999929 | -0.545 | -0.273 | -0.182 |
| 1.382499999999929 | -0.544 | -0.272 | -0.181 |
| 1.384999999999929 | -0.543 | -0.272 | -0.181 |
| 1.387499999999929 | -0.543 | -0.271 | -0.181 |
| 1.389999999999929 | -0.542 | -0.271 | -0.181 |
| 1.392499999999929 | -0.541 | -0.271 | -0.18 |
| 1.394999999999928 | -0.54 | -0.27 | -0.18 |
| 1.397499999999928 | -0.54 | -0.27 | -0.18 |
| 1.399999999999928 | -0.539 | -0.269 | -0.18 |
| 1.402499999999928 | -0.538 | -0.269 | -0.179 |
| 1.404999999999928 | -0.538 | -0.269 | -0.179 |
| 1.407499999999928 | -0.537 | -0.268 | -0.179 |
| 1.409999999999928 | -0.536 | -0.268 | -0.179 |
| 1.412499999999928 | -0.535 | -0.268 | -0.178 |
| 1.414999999999928 | -0.535 | -0.267 | -0.178 |
| 1.417499999999928 | -0.534 | -0.267 | -0.178 |
| 1.419999999999928 | -0.533 | -0.267 | -0.178 |
| 1.422499999999928 | -0.532 | -0.266 | -0.177 |
| 1.424999999999928 | -0.532 | -0.266 | -0.177 |
| 1.427499999999928 | -0.531 | -0.265 | -0.177 |
| 1.429999999999928 | -0.53 | -0.265 | -0.177 |
| 1.432499999999928 | -0.529 | -0.265 | -0.176 |
| 1.434999999999928 | -0.529 | -0.264 | -0.176 |
| 1.437499999999928 | -0.528 | -0.264 | -0.176 |
| 1.439999999999928 | -0.527 | -0.264 | -0.176 |
| 1.442499999999927 | -0.527 | -0.263 | -0.176 |
| 1.444999999999927 | -0.526 | -0.263 | -0.175 |
| 1.447499999999927 | -0.525 | -0.263 | -0.175 |
| 1.449999999999927 | -0.525 | -0.262 | -0.175 |
| 1.452499999999927 | -0.524 | -0.262 | -0.175 |
| 1.454999999999927 | -0.523 | -0.262 | -0.174 |
| 1.457499999999927 | -0.522 | -0.261 | -0.174 |
| 1.459999999999927 | -0.522 | -0.261 | -0.174 |
| 1.462499999999927 | -0.521 | -0.261 | -0.174 |
| 1.464999999999927 | -0.52 | -0.26 | -0.173 |
| 1.467499999999927 | -0.52 | -0.26 | -0.173 |
| 1.469999999999927 | -0.519 | -0.259 | -0.173 |
| 1.472499999999927 | -0.518 | -0.259 | -0.173 |
| 1.474999999999927 | -0.518 | -0.259 | -0.173 |
| 1.477499999999927 | -0.517 | -0.258 | -0.172 |
| 1.479999999999927 | -0.516 | -0.258 | -0.172 |
| 1.482499999999927 | -0.516 | -0.258 | -0.172 |
| 1.484999999999927 | -0.515 | -0.257 | -0.172 |
| 1.487499999999927 | -0.514 | -0.257 | -0.171 |
| 1.489999999999926 | -0.514 | -0.257 | -0.171 |
| 1.492499999999926 | -0.513 | -0.256 | -0.171 |
| 1.494999999999926 | -0.512 | -0.256 | -0.171 |
| 1.497499999999926 | -0.511 | -0.256 | -0.17 |
| 1.499999999999926 | -0.511 | -0.255 | -0.17 |
| 1.502499999999926 | -0.51 | -0.255 | -0.17 |
| 1.504999999999926 | -0.509 | -0.255 | -0.17 |
| 1.507499999999926 | -0.509 | -0.254 | -0.17 |
| 1.509999999999926 | -0.508 | -0.254 | -0.169 |
| 1.512499999999926 | -0.508 | -0.254 | -0.169 |
| 1.514999999999926 | -0.507 | -0.253 | -0.169 |
| 1.517499999999926 | -0.506 | -0.253 | -0.169 |
| 1.519999999999926 | -0.506 | -0.253 | -0.169 |
| 1.522499999999926 | -0.505 | -0.252 | -0.168 |
| 1.524999999999926 | -0.504 | -0.252 | -0.168 |
| 1.527499999999926 | -0.504 | -0.252 | -0.168 |
| 1.529999999999926 | -0.503 | -0.251 | -0.168 |
| 1.532499999999926 | -0.502 | -0.251 | -0.167 |
| 1.534999999999926 | -0.502 | -0.251 | -0.167 |
| 1.537499999999925 | -0.501 | -0.251 | -0.167 |
| 1.539999999999925 | -0.5 | -0.25 | -0.167 |
| 1.542499999999925 | -0.5 | -0.25 | -0.167 |
| 1.544999999999925 | -0.499 | -0.25 | -0.166 |
| 1.547499999999925 | -0.498 | -0.249 | -0.166 |
| 1.549999999999925 | -0.498 | -0.249 | -0.166 |
| 1.552499999999925 | -0.497 | -0.249 | -0.166 |
| 1.554999999999925 | -0.497 | -0.248 | -0.166 |
| 1.557499999999925 | -0.496 | -0.248 | -0.165 |
| 1.559999999999925 | -0.495 | -0.248 | -0.165 |
| 1.562499999999925 | -0.495 | -0.247 | -0.165 |
| 1.564999999999925 | -0.494 | -0.247 | -0.165 |
| 1.567499999999925 | -0.493 | -0.247 | -0.164 |
| 1.569999999999925 | -0.493 | -0.246 | -0.164 |
| 1.572499999999925 | -0.492 | -0.246 | -0.164 |
| 1.574999999999925 | -0.492 | -0.246 | -0.164 |
| 1.577499999999925 | -0.491 | -0.245 | -0.164 |
| 1.579999999999925 | -0.49 | -0.245 | -0.163 |
| 1.582499999999925 | -0.49 | -0.245 | -0.163 |
| 1.584999999999924 | -0.489 | -0.245 | -0.163 |
| 1.587499999999924 | -0.489 | -0.244 | -0.163 |
| 1.589999999999924 | -0.488 | -0.244 | -0.163 |
| 1.592499999999924 | -0.487 | -0.244 | -0.162 |
| 1.594999999999924 | -0.487 | -0.243 | -0.162 |
| 1.597499999999924 | -0.486 | -0.243 | -0.162 |
| 1.599999999999924 | -0.486 | -0.243 | -0.162 |
| 1.602499999999924 | -0.485 | -0.242 | -0.162 |
| 1.604999999999924 | -0.484 | -0.242 | -0.161 |
| 1.607499999999924 | -0.484 | -0.242 | -0.161 |
| 1.609999999999924 | -0.483 | -0.242 | -0.161 |
| 1.612499999999924 | -0.483 | -0.241 | -0.161 |
| 1.614999999999924 | -0.482 | -0.241 | -0.161 |
| 1.617499999999924 | -0.481 | -0.241 | -0.16 |
| 1.619999999999924 | -0.481 | -0.24 | -0.16 |
| 1.622499999999924 | -0.48 | -0.24 | -0.16 |
| 1.624999999999924 | -0.48 | -0.24 | -0.16 |
| 1.627499999999923 | -0.479 | -0.239 | -0.16 |
| 1.629999999999923 | -0.478 | -0.239 | -0.159 |
| 1.632499999999923 | -0.478 | -0.239 | -0.159 |
| 1.634999999999923 | -0.477 | -0.239 | -0.159 |
| 1.637499999999923 | -0.477 | -0.238 | -0.159 |
| 1.639999999999923 | -0.476 | -0.238 | -0.159 |
| 1.642499999999923 | -0.476 | -0.238 | -0.159 |
| 1.644999999999923 | -0.475 | -0.237 | -0.158 |
| 1.647499999999923 | -0.474 | -0.237 | -0.158 |
| 1.649999999999923 | -0.474 | -0.237 | -0.158 |
| 1.652499999999923 | -0.473 | -0.237 | -0.158 |
| 1.654999999999923 | -0.473 | -0.236 | -0.158 |
| 1.657499999999923 | -0.472 | -0.236 | -0.157 |
| 1.659999999999923 | -0.472 | -0.236 | -0.157 |
| 1.662499999999923 | -0.471 | -0.235 | -0.157 |
| 1.664999999999923 | -0.47 | -0.235 | -0.157 |
| 1.667499999999923 | -0.47 | -0.235 | -0.157 |
| 1.669999999999923 | -0.469 | -0.235 | -0.156 |
| 1.672499999999923 | -0.469 | -0.234 | -0.156 |
| 1.674999999999922 | -0.468 | -0.234 | -0.156 |
| 1.677499999999922 | -0.468 | -0.234 | -0.156 |
| 1.679999999999922 | -0.467 | -0.234 | -0.156 |
| 1.682499999999922 | -0.466 | -0.233 | -0.155 |
| 1.684999999999922 | -0.466 | -0.233 | -0.155 |
| 1.687499999999922 | -0.465 | -0.233 | -0.155 |
| 1.689999999999922 | -0.465 | -0.232 | -0.155 |
| 1.692499999999922 | -0.464 | -0.232 | -0.155 |
| 1.694999999999922 | -0.464 | -0.232 | -0.155 |
| 1.697499999999922 | -0.463 | -0.232 | -0.154 |
| 1.699999999999922 | -0.463 | -0.231 | -0.154 |
| 1.702499999999922 | -0.462 | -0.231 | -0.154 |
| 1.704999999999922 | -0.462 | -0.231 | -0.154 |
| 1.707499999999922 | -0.461 | -0.23 | -0.154 |
| 1.709999999999922 | -0.46 | -0.23 | -0.153 |
| 1.712499999999922 | -0.46 | -0.23 | -0.153 |
| 1.714999999999922 | -0.459 | -0.23 | -0.153 |
| 1.717499999999922 | -0.459 | -0.229 | -0.153 |
| 1.719999999999922 | -0.458 | -0.229 | -0.153 |
| 1.722499999999921 | -0.458 | -0.229 | -0.153 |
| 1.724999999999921 | -0.457 | -0.229 | -0.152 |
| 1.727499999999921 | -0.457 | -0.228 | -0.152 |
| 1.729999999999921 | -0.456 | -0.228 | -0.152 |
| 1.732499999999921 | -0.456 | -0.228 | -0.152 |
| 1.734999999999921 | -0.455 | -0.228 | -0.152 |
| 1.737499999999921 | -0.455 | -0.227 | -0.152 |
| 1.739999999999921 | -0.454 | -0.227 | -0.151 |
| 1.742499999999921 | -0.454 | -0.227 | -0.151 |
| 1.744999999999921 | -0.453 | -0.227 | -0.151 |
| 1.747499999999921 | -0.453 | -0.226 | -0.151 |
| 1.749999999999921 | -0.452 | -0.226 | -0.151 |
| 1.752499999999921 | -0.451 | -0.226 | -0.15 |
| 1.754999999999921 | -0.451 | -0.225 | -0.15 |
| 1.757499999999921 | -0.45 | -0.225 | -0.15 |
| 1.759999999999921 | -0.45 | -0.225 | -0.15 |
| 1.762499999999921 | -0.449 | -0.225 | -0.15 |
| 1.764999999999921 | -0.449 | -0.224 | -0.15 |
| 1.76749999999992 | -0.448 | -0.224 | -0.149 |
| 1.76999999999992 | -0.448 | -0.224 | -0.149 |
| 1.77249999999992 | -0.447 | -0.224 | -0.149 |
| 1.77499999999992 | -0.447 | -0.223 | -0.149 |
| 1.77749999999992 | -0.446 | -0.223 | -0.149 |
| 1.77999999999992 | -0.446 | -0.223 | -0.149 |
| 1.78249999999992 | -0.445 | -0.223 | -0.148 |
| 1.78499999999992 | -0.445 | -0.222 | -0.148 |
| 1.78749999999992 | -0.444 | -0.222 | -0.148 |
| 1.78999999999992 | -0.444 | -0.222 | -0.148 |
| 1.79249999999992 | -0.443 | -0.222 | -0.148 |
| 1.79499999999992 | -0.443 | -0.221 | -0.148 |
| 1.79749999999992 | -0.442 | -0.221 | -0.147 |
| 1.79999999999992 | -0.442 | -0.221 | -0.147 |
| 1.80249999999992 | -0.441 | -0.221 | -0.147 |
| 1.80499999999992 | -0.441 | -0.22 | -0.147 |
| 1.80749999999992 | -0.44 | -0.22 | -0.147 |
| 1.80999999999992 | -0.44 | -0.22 | -0.147 |
| 1.81249999999992 | -0.439 | -0.22 | -0.146 |
| 1.81499999999992 | -0.439 | -0.219 | -0.146 |
| 1.817499999999919 | -0.438 | -0.219 | -0.146 |
| 1.819999999999919 | -0.438 | -0.219 | -0.146 |
| 1.822499999999919 | -0.437 | -0.219 | -0.146 |
| 1.824999999999919 | -0.437 | -0.218 | -0.146 |
| 1.827499999999919 | -0.436 | -0.218 | -0.145 |
| 1.829999999999919 | -0.436 | -0.218 | -0.145 |
| 1.832499999999919 | -0.435 | -0.218 | -0.145 |
| 1.834999999999919 | -0.435 | -0.217 | -0.145 |
| 1.837499999999919 | -0.435 | -0.217 | -0.145 |
| 1.839999999999919 | -0.434 | -0.217 | -0.145 |
| 1.842499999999919 | -0.434 | -0.217 | -0.145 |
| 1.844999999999919 | -0.433 | -0.217 | -0.144 |
| 1.847499999999919 | -0.433 | -0.216 | -0.144 |
| 1.849999999999919 | -0.432 | -0.216 | -0.144 |
| 1.852499999999919 | -0.432 | -0.216 | -0.144 |
| 1.854999999999919 | -0.431 | -0.216 | -0.144 |
| 1.857499999999919 | -0.431 | -0.215 | -0.144 |
| 1.859999999999919 | -0.43 | -0.215 | -0.143 |
| 1.862499999999918 | -0.43 | -0.215 | -0.143 |
| 1.864999999999918 | -0.429 | -0.215 | -0.143 |
| 1.867499999999918 | -0.429 | -0.214 | -0.143 |
| 1.869999999999918 | -0.428 | -0.214 | -0.143 |
| 1.872499999999918 | -0.428 | -0.214 | -0.143 |
| 1.874999999999918 | -0.427 | -0.214 | -0.142 |
| 1.877499999999918 | -0.427 | -0.213 | -0.142 |
| 1.879999999999918 | -0.427 | -0.213 | -0.142 |
| 1.882499999999918 | -0.426 | -0.213 | -0.142 |
| 1.884999999999918 | -0.426 | -0.213 | -0.142 |
| 1.887499999999918 | -0.425 | -0.213 | -0.142 |
| 1.889999999999918 | -0.425 | -0.212 | -0.142 |
| 1.892499999999918 | -0.424 | -0.212 | -0.141 |
| 1.894999999999918 | -0.424 | -0.212 | -0.141 |
| 1.897499999999918 | -0.423 | -0.212 | -0.141 |
| 1.899999999999918 | -0.423 | -0.211 | -0.141 |
| 1.902499999999918 | -0.422 | -0.211 | -0.141 |
| 1.904999999999918 | -0.422 | -0.211 | -0.141 |
| 1.907499999999918 | -0.422 | -0.211 | -0.141 |
| 1.909999999999918 | -0.421 | -0.211 | -0.14 |
| 1.912499999999917 | -0.421 | -0.21 | -0.14 |
| 1.914999999999917 | -0.42 | -0.21 | -0.14 |
| 1.917499999999917 | -0.42 | -0.21 | -0.14 |
| 1.919999999999917 | -0.419 | -0.21 | -0.14 |
| 1.922499999999917 | -0.419 | -0.209 | -0.14 |
| 1.924999999999917 | -0.418 | -0.209 | -0.139 |
| 1.927499999999917 | -0.418 | -0.209 | -0.139 |
| 1.929999999999917 | -0.417 | -0.209 | -0.139 |
| 1.932499999999917 | -0.417 | -0.209 | -0.139 |
| 1.934999999999917 | -0.417 | -0.208 | -0.139 |
| 1.937499999999917 | -0.416 | -0.208 | -0.139 |
| 1.939999999999917 | -0.416 | -0.208 | -0.139 |
| 1.942499999999917 | -0.415 | -0.208 | -0.138 |
| 1.944999999999917 | -0.415 | -0.207 | -0.138 |
| 1.947499999999917 | -0.414 | -0.207 | -0.138 |
| 1.949999999999917 | -0.414 | -0.207 | -0.138 |
| 1.952499999999917 | -0.414 | -0.207 | -0.138 |
| 1.954999999999917 | -0.413 | -0.207 | -0.138 |
| 1.957499999999916 | -0.413 | -0.206 | -0.138 |
| 1.959999999999916 | -0.412 | -0.206 | -0.137 |
| 1.962499999999916 | -0.412 | -0.206 | -0.137 |
| 1.964999999999916 | -0.411 | -0.206 | -0.137 |
| 1.967499999999916 | -0.411 | -0.205 | -0.137 |
| 1.969999999999916 | -0.411 | -0.205 | -0.137 |
| 1.972499999999916 | -0.41 | -0.205 | -0.137 |
| 1.974999999999916 | -0.41 | -0.205 | -0.137 |
| 1.977499999999916 | -0.409 | -0.205 | -0.136 |
| 1.979999999999916 | -0.409 | -0.204 | -0.136 |
| 1.982499999999916 | -0.408 | -0.204 | -0.136 |
| 1.984999999999916 | -0.408 | -0.204 | -0.136 |
| 1.987499999999916 | -0.408 | -0.204 | -0.136 |
| 1.989999999999916 | -0.407 | -0.204 | -0.136 |
| 1.992499999999916 | -0.407 | -0.203 | -0.136 |
| 1.994999999999916 | -0.406 | -0.203 | -0.135 |
| 1.997499999999916 | -0.406 | -0.203 | -0.135 |
| 1.999999999999916 | -0.405 | -0.203 | -0.135 |